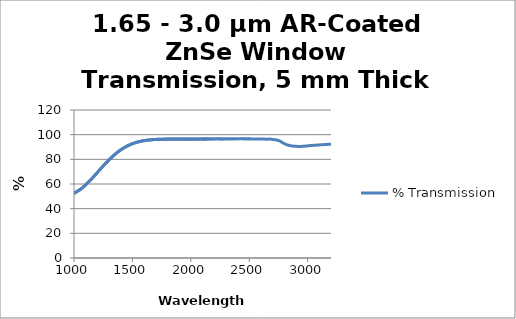
| Category | % Transmission |
|---|---|
| 200.0 | 0.103 |
| 201.0 | 0.503 |
| 202.0 | 0.29 |
| 203.0 | 0.488 |
| 204.0 | 0.591 |
| 205.0 | 0.22 |
| 206.0 | 0.072 |
| 207.0 | 0.144 |
| 208.0 | 0.358 |
| 209.0 | 0.074 |
| 210.0 | 0.151 |
| 211.0 | 0.011 |
| 212.0 | 0.102 |
| 213.0 | 0.163 |
| 214.0 | 0.028 |
| 215.0 | 0.148 |
| 216.0 | 0.027 |
| 217.0 | 0.239 |
| 218.0 | 0.027 |
| 219.0 | 0.099 |
| 220.0 | 0.036 |
| 221.0 | 0.032 |
| 222.0 | 0.033 |
| 223.0 | 0.052 |
| 224.0 | 0.136 |
| 225.0 | 0.124 |
| 226.0 | 0.081 |
| 227.0 | 0.028 |
| 228.0 | 0.052 |
| 229.0 | 0.037 |
| 230.0 | 0.053 |
| 231.0 | 0.019 |
| 232.0 | 0.05 |
| 233.0 | 0.009 |
| 234.0 | 0.067 |
| 235.0 | 0.038 |
| 236.0 | 0.023 |
| 237.0 | 0.031 |
| 238.0 | 0.028 |
| 239.0 | 0.024 |
| 240.0 | 0.084 |
| 241.0 | 0.049 |
| 242.0 | 0.003 |
| 243.0 | 0.014 |
| 244.0 | 0.02 |
| 245.0 | 0.086 |
| 246.0 | 0.016 |
| 247.0 | 0.057 |
| 248.0 | 0.019 |
| 249.0 | 0.046 |
| 250.0 | 0.082 |
| 251.0 | 0.052 |
| 252.0 | 0.012 |
| 253.0 | 0.071 |
| 254.0 | 0.045 |
| 255.0 | 0.111 |
| 256.0 | 0.038 |
| 257.0 | 0.072 |
| 258.0 | 0.012 |
| 259.0 | 0.014 |
| 260.0 | 0.057 |
| 261.0 | 0.013 |
| 262.0 | 0.077 |
| 263.0 | 0.011 |
| 264.0 | 0.031 |
| 265.0 | 0.084 |
| 266.0 | 0.119 |
| 267.0 | 0.043 |
| 268.0 | 0.095 |
| 269.0 | 0.002 |
| 270.0 | 0.103 |
| 271.0 | 0.022 |
| 272.0 | 0.22 |
| 273.0 | 0.058 |
| 274.0 | 0.028 |
| 275.0 | 0.174 |
| 276.0 | 0.098 |
| 277.0 | 0.15 |
| 278.0 | 0.437 |
| 279.0 | 0.124 |
| 280.0 | 0.276 |
| 281.0 | 0.004 |
| 282.0 | 0.214 |
| 283.0 | 0.263 |
| 284.0 | 0.18 |
| 285.0 | 0 |
| 286.0 | 0.052 |
| 287.0 | 0.193 |
| 288.0 | 0.064 |
| 289.0 | 0.121 |
| 290.0 | 0.086 |
| 291.0 | 0.144 |
| 292.0 | 0.012 |
| 293.0 | 0.008 |
| 294.0 | 0.095 |
| 295.0 | 0.041 |
| 296.0 | 0.291 |
| 297.0 | 0.24 |
| 298.0 | 0.052 |
| 299.0 | 0.456 |
| 300.0 | 0.021 |
| 301.0 | 0.126 |
| 302.0 | 0.072 |
| 303.0 | 0.145 |
| 304.0 | 0.037 |
| 305.0 | 0.015 |
| 306.0 | 0.096 |
| 307.0 | 0.05 |
| 308.0 | 0.026 |
| 309.0 | 0.213 |
| 310.0 | 0.137 |
| 311.0 | 0.446 |
| 312.0 | 0.115 |
| 313.0 | 0.314 |
| 314.0 | 0.027 |
| 315.0 | 0.148 |
| 316.0 | 0.162 |
| 317.0 | 0.061 |
| 318.0 | 0.07 |
| 319.0 | 0.169 |
| 320.0 | 0.077 |
| 321.0 | 0.104 |
| 322.0 | 0.489 |
| 323.0 | 0.139 |
| 324.0 | 0.175 |
| 325.0 | 0.138 |
| 326.0 | 0.007 |
| 327.0 | 0.124 |
| 328.0 | 0.042 |
| 329.0 | 0.026 |
| 330.0 | 0.296 |
| 331.0 | 0.403 |
| 332.0 | 0.264 |
| 333.0 | 0.137 |
| 334.0 | 0.018 |
| 335.0 | 0.091 |
| 336.0 | 0.067 |
| 337.0 | 0.267 |
| 338.0 | 0.178 |
| 339.0 | 0.253 |
| 340.0 | 0.423 |
| 341.0 | 0.186 |
| 342.0 | 0.432 |
| 343.0 | 0.093 |
| 344.0 | 0.004 |
| 345.0 | 0.31 |
| 346.0 | 0.226 |
| 347.0 | 0.463 |
| 348.0 | 0.211 |
| 349.0 | 0.019 |
| 350.0 | 0.17 |
| 351.0 | 0.297 |
| 352.0 | 0.186 |
| 353.0 | 0.063 |
| 354.0 | 0.062 |
| 355.0 | 0.021 |
| 356.0 | 0.117 |
| 357.0 | 0.156 |
| 358.0 | 0.009 |
| 359.0 | 0.15 |
| 360.0 | 0.175 |
| 361.0 | 0.088 |
| 362.0 | 0.254 |
| 363.0 | 0.021 |
| 364.0 | 0.207 |
| 365.0 | 0.105 |
| 366.0 | 0.018 |
| 367.0 | 0.156 |
| 368.0 | 0.099 |
| 369.0 | 0.034 |
| 370.0 | 0.005 |
| 371.0 | 0.337 |
| 372.0 | 0.052 |
| 373.0 | 0.26 |
| 374.0 | 0.041 |
| 375.0 | 0.064 |
| 376.0 | 0.061 |
| 377.0 | 0.031 |
| 378.0 | 0.062 |
| 379.0 | 0.035 |
| 380.0 | 0.028 |
| 381.0 | 0.026 |
| 382.0 | 0.108 |
| 383.0 | 0.015 |
| 384.0 | 0.004 |
| 385.0 | 0.005 |
| 386.0 | 0.001 |
| 387.0 | 0.073 |
| 388.0 | 0.026 |
| 389.0 | 0.018 |
| 390.0 | 0.001 |
| 391.0 | 0.03 |
| 392.0 | 0.072 |
| 393.0 | 0.003 |
| 394.0 | 0.045 |
| 395.0 | 0.051 |
| 396.0 | 0.019 |
| 397.0 | 0.118 |
| 398.0 | 0.114 |
| 399.0 | 0.044 |
| 400.0 | 0.013 |
| 401.0 | 0.054 |
| 402.0 | 0.034 |
| 403.0 | 0.093 |
| 404.0 | 0.027 |
| 405.0 | 0.007 |
| 406.0 | 0.02 |
| 407.0 | 0.024 |
| 408.0 | 0 |
| 409.0 | 0.004 |
| 410.0 | 0.017 |
| 411.0 | 0.017 |
| 412.0 | 0.05 |
| 413.0 | 0.028 |
| 414.0 | 0.02 |
| 415.0 | 0.009 |
| 416.0 | 0.035 |
| 417.0 | 0.034 |
| 418.0 | 0.044 |
| 419.0 | 0.018 |
| 420.0 | 0.053 |
| 421.0 | 0.022 |
| 422.0 | 0.02 |
| 423.0 | 0.012 |
| 424.0 | 0.013 |
| 425.0 | 0.01 |
| 426.0 | 0.023 |
| 427.0 | 0.024 |
| 428.0 | 0.004 |
| 429.0 | 0.014 |
| 430.0 | 0.006 |
| 431.0 | 0.017 |
| 432.0 | 0.039 |
| 433.0 | 0.027 |
| 434.0 | 0.009 |
| 435.0 | 0.026 |
| 436.0 | 0.009 |
| 437.0 | 0.01 |
| 438.0 | 0.019 |
| 439.0 | 0.004 |
| 440.0 | 0.01 |
| 441.0 | 0.023 |
| 442.0 | 0.016 |
| 443.0 | 0.022 |
| 444.0 | 0.023 |
| 445.0 | 0.016 |
| 446.0 | 0.008 |
| 447.0 | 0.007 |
| 448.0 | 0.023 |
| 449.0 | 0.005 |
| 450.0 | 0.008 |
| 451.0 | 0.015 |
| 452.0 | 0.004 |
| 453.0 | 0.016 |
| 454.0 | 0.017 |
| 455.0 | 0.008 |
| 456.0 | 0.013 |
| 457.0 | 0.006 |
| 458.0 | 0.004 |
| 459.0 | 0.015 |
| 460.0 | 0.053 |
| 461.0 | 0.001 |
| 462.0 | 0 |
| 463.0 | 0.036 |
| 464.0 | 0.015 |
| 465.0 | 0.003 |
| 466.0 | 0.029 |
| 467.0 | 0.015 |
| 468.0 | 0.026 |
| 469.0 | 0.019 |
| 470.0 | 0.024 |
| 471.0 | 0.014 |
| 472.0 | 0.001 |
| 473.0 | 0.022 |
| 474.0 | 0.073 |
| 475.0 | 0.193 |
| 476.0 | 0.447 |
| 477.0 | 0.811 |
| 478.0 | 1.261 |
| 479.0 | 1.815 |
| 480.0 | 2.378 |
| 481.0 | 2.961 |
| 482.0 | 3.583 |
| 483.0 | 4.148 |
| 484.0 | 4.747 |
| 485.0 | 5.335 |
| 486.0 | 5.918 |
| 487.0 | 6.555 |
| 488.0 | 7.177 |
| 489.0 | 7.82 |
| 490.0 | 8.458 |
| 491.0 | 9.147 |
| 492.0 | 9.832 |
| 493.0 | 10.509 |
| 494.0 | 11.228 |
| 495.0 | 11.953 |
| 496.0 | 12.651 |
| 497.0 | 13.384 |
| 498.0 | 14.083 |
| 499.0 | 14.851 |
| 500.0 | 15.579 |
| 501.0 | 16.294 |
| 502.0 | 17.055 |
| 503.0 | 17.802 |
| 504.0 | 18.538 |
| 505.0 | 19.301 |
| 506.0 | 20.069 |
| 507.0 | 20.842 |
| 508.0 | 21.631 |
| 509.0 | 22.467 |
| 510.0 | 23.311 |
| 511.0 | 24.141 |
| 512.0 | 25.081 |
| 513.0 | 25.997 |
| 514.0 | 26.946 |
| 515.0 | 28.006 |
| 516.0 | 29.059 |
| 517.0 | 30.196 |
| 518.0 | 31.372 |
| 519.0 | 32.508 |
| 520.0 | 33.697 |
| 521.0 | 34.852 |
| 522.0 | 35.943 |
| 523.0 | 36.989 |
| 524.0 | 37.966 |
| 525.0 | 38.928 |
| 526.0 | 39.776 |
| 527.0 | 40.633 |
| 528.0 | 41.462 |
| 529.0 | 42.181 |
| 530.0 | 42.943 |
| 531.0 | 43.667 |
| 532.0 | 44.337 |
| 533.0 | 45.096 |
| 534.0 | 45.762 |
| 535.0 | 46.366 |
| 536.0 | 47.049 |
| 537.0 | 47.711 |
| 538.0 | 48.294 |
| 539.0 | 48.97 |
| 540.0 | 49.591 |
| 541.0 | 50.227 |
| 542.0 | 50.838 |
| 543.0 | 51.461 |
| 544.0 | 52.076 |
| 545.0 | 52.667 |
| 546.0 | 53.254 |
| 547.0 | 53.837 |
| 548.0 | 54.541 |
| 549.0 | 54.999 |
| 550.0 | 55.514 |
| 551.0 | 56.13 |
| 552.0 | 56.67 |
| 553.0 | 57.135 |
| 554.0 | 57.679 |
| 555.0 | 58.174 |
| 556.0 | 58.626 |
| 557.0 | 59.091 |
| 558.0 | 59.545 |
| 559.0 | 59.96 |
| 560.0 | 60.395 |
| 561.0 | 60.837 |
| 562.0 | 61.202 |
| 563.0 | 61.551 |
| 564.0 | 61.996 |
| 565.0 | 62.258 |
| 566.0 | 62.575 |
| 567.0 | 62.937 |
| 568.0 | 63.184 |
| 569.0 | 63.426 |
| 570.0 | 63.682 |
| 571.0 | 63.959 |
| 572.0 | 64.142 |
| 573.0 | 64.344 |
| 574.0 | 64.538 |
| 575.0 | 64.741 |
| 576.0 | 64.801 |
| 577.0 | 64.948 |
| 578.0 | 65.087 |
| 579.0 | 65.127 |
| 580.0 | 65.194 |
| 581.0 | 65.286 |
| 582.0 | 65.273 |
| 583.0 | 65.294 |
| 584.0 | 65.327 |
| 585.0 | 65.286 |
| 586.0 | 65.242 |
| 587.0 | 65.238 |
| 588.0 | 65.146 |
| 589.0 | 65.049 |
| 590.0 | 64.953 |
| 591.0 | 64.831 |
| 592.0 | 64.748 |
| 593.0 | 64.627 |
| 594.0 | 64.41 |
| 595.0 | 64.241 |
| 596.0 | 64.129 |
| 597.0 | 63.901 |
| 598.0 | 63.686 |
| 599.0 | 63.519 |
| 600.0 | 63.31 |
| 601.0 | 63.033 |
| 602.0 | 62.857 |
| 603.0 | 62.62 |
| 604.0 | 62.36 |
| 605.0 | 62.152 |
| 606.0 | 61.864 |
| 607.0 | 61.604 |
| 608.0 | 61.376 |
| 609.0 | 61.126 |
| 610.0 | 60.817 |
| 611.0 | 60.565 |
| 612.0 | 60.318 |
| 613.0 | 60.014 |
| 614.0 | 59.755 |
| 615.0 | 59.445 |
| 616.0 | 59.158 |
| 617.0 | 58.849 |
| 618.0 | 58.58 |
| 619.0 | 58.256 |
| 620.0 | 57.99 |
| 621.0 | 57.756 |
| 622.0 | 57.443 |
| 623.0 | 57.15 |
| 624.0 | 56.858 |
| 625.0 | 56.56 |
| 626.0 | 56.281 |
| 627.0 | 56.028 |
| 628.0 | 55.727 |
| 629.0 | 55.495 |
| 630.0 | 55.229 |
| 631.0 | 54.92 |
| 632.0 | 54.676 |
| 633.0 | 54.42 |
| 634.0 | 54.157 |
| 635.0 | 53.889 |
| 636.0 | 53.659 |
| 637.0 | 53.373 |
| 638.0 | 53.16 |
| 639.0 | 52.908 |
| 640.0 | 52.67 |
| 641.0 | 52.43 |
| 642.0 | 52.204 |
| 643.0 | 51.982 |
| 644.0 | 51.74 |
| 645.0 | 51.572 |
| 646.0 | 51.333 |
| 647.0 | 51.119 |
| 648.0 | 50.906 |
| 649.0 | 50.731 |
| 650.0 | 50.536 |
| 651.0 | 50.364 |
| 652.0 | 50.198 |
| 653.0 | 49.98 |
| 654.0 | 49.823 |
| 655.0 | 49.65 |
| 656.0 | 49.476 |
| 657.0 | 49.316 |
| 658.0 | 49.174 |
| 659.0 | 48.986 |
| 660.0 | 48.837 |
| 661.0 | 48.687 |
| 662.0 | 48.553 |
| 663.0 | 48.404 |
| 664.0 | 48.305 |
| 665.0 | 48.125 |
| 666.0 | 48.034 |
| 667.0 | 47.907 |
| 668.0 | 47.745 |
| 669.0 | 47.678 |
| 670.0 | 47.562 |
| 671.0 | 47.432 |
| 672.0 | 47.349 |
| 673.0 | 47.24 |
| 674.0 | 47.162 |
| 675.0 | 47.071 |
| 676.0 | 46.984 |
| 677.0 | 46.882 |
| 678.0 | 46.798 |
| 679.0 | 46.74 |
| 680.0 | 46.629 |
| 681.0 | 46.589 |
| 682.0 | 46.531 |
| 683.0 | 46.443 |
| 684.0 | 46.362 |
| 685.0 | 46.336 |
| 686.0 | 46.264 |
| 687.0 | 46.206 |
| 688.0 | 46.163 |
| 689.0 | 46.108 |
| 690.0 | 46.04 |
| 691.0 | 46.015 |
| 692.0 | 45.997 |
| 693.0 | 45.966 |
| 694.0 | 45.95 |
| 695.0 | 45.891 |
| 696.0 | 45.871 |
| 697.0 | 45.836 |
| 698.0 | 45.818 |
| 699.0 | 45.803 |
| 700.0 | 45.797 |
| 701.0 | 45.774 |
| 702.0 | 45.767 |
| 703.0 | 45.749 |
| 704.0 | 45.728 |
| 705.0 | 45.728 |
| 706.0 | 45.724 |
| 707.0 | 45.722 |
| 708.0 | 45.741 |
| 709.0 | 45.761 |
| 710.0 | 45.757 |
| 711.0 | 45.747 |
| 712.0 | 45.774 |
| 713.0 | 45.783 |
| 714.0 | 45.768 |
| 715.0 | 45.808 |
| 716.0 | 45.834 |
| 717.0 | 45.854 |
| 718.0 | 45.889 |
| 719.0 | 45.906 |
| 720.0 | 45.912 |
| 721.0 | 45.932 |
| 722.0 | 45.984 |
| 723.0 | 46.001 |
| 724.0 | 46.027 |
| 725.0 | 46.046 |
| 726.0 | 46.061 |
| 727.0 | 46.124 |
| 728.0 | 46.172 |
| 729.0 | 46.203 |
| 730.0 | 46.215 |
| 731.0 | 46.279 |
| 732.0 | 46.29 |
| 733.0 | 46.35 |
| 734.0 | 46.409 |
| 735.0 | 46.405 |
| 736.0 | 46.488 |
| 737.0 | 46.53 |
| 738.0 | 46.576 |
| 739.0 | 46.637 |
| 740.0 | 46.679 |
| 741.0 | 46.678 |
| 742.0 | 46.791 |
| 743.0 | 46.798 |
| 744.0 | 46.836 |
| 745.0 | 46.895 |
| 746.0 | 46.96 |
| 747.0 | 46.986 |
| 748.0 | 47.013 |
| 749.0 | 47.136 |
| 750.0 | 47.136 |
| 751.0 | 47.212 |
| 752.0 | 47.268 |
| 753.0 | 47.294 |
| 754.0 | 47.347 |
| 755.0 | 47.405 |
| 756.0 | 47.462 |
| 757.0 | 47.501 |
| 758.0 | 47.596 |
| 759.0 | 47.62 |
| 760.0 | 47.668 |
| 761.0 | 47.729 |
| 762.0 | 47.814 |
| 763.0 | 47.842 |
| 764.0 | 47.899 |
| 765.0 | 47.962 |
| 766.0 | 48.005 |
| 767.0 | 48.087 |
| 768.0 | 48.091 |
| 769.0 | 48.144 |
| 770.0 | 48.219 |
| 771.0 | 48.25 |
| 772.0 | 48.307 |
| 773.0 | 48.364 |
| 774.0 | 48.408 |
| 775.0 | 48.415 |
| 776.0 | 48.5 |
| 777.0 | 48.578 |
| 778.0 | 48.56 |
| 779.0 | 48.661 |
| 780.0 | 48.704 |
| 781.0 | 48.722 |
| 782.0 | 48.786 |
| 783.0 | 48.842 |
| 784.0 | 48.882 |
| 785.0 | 48.91 |
| 786.0 | 48.983 |
| 787.0 | 49.018 |
| 788.0 | 49.062 |
| 789.0 | 49.098 |
| 790.0 | 49.128 |
| 791.0 | 49.182 |
| 792.0 | 49.219 |
| 793.0 | 49.256 |
| 794.0 | 49.285 |
| 795.0 | 49.342 |
| 796.0 | 49.375 |
| 797.0 | 49.41 |
| 798.0 | 49.467 |
| 799.0 | 49.481 |
| 800.0 | 49.394 |
| 801.0 | 49.429 |
| 802.0 | 49.455 |
| 803.0 | 49.486 |
| 804.0 | 49.529 |
| 805.0 | 49.561 |
| 806.0 | 49.579 |
| 807.0 | 49.611 |
| 808.0 | 49.647 |
| 809.0 | 49.645 |
| 810.0 | 49.707 |
| 811.0 | 49.715 |
| 812.0 | 49.739 |
| 813.0 | 49.772 |
| 814.0 | 49.786 |
| 815.0 | 49.818 |
| 816.0 | 49.844 |
| 817.0 | 49.874 |
| 818.0 | 49.892 |
| 819.0 | 49.917 |
| 820.0 | 49.919 |
| 821.0 | 49.943 |
| 822.0 | 49.948 |
| 823.0 | 49.986 |
| 824.0 | 49.977 |
| 825.0 | 50.012 |
| 826.0 | 50.035 |
| 827.0 | 50.042 |
| 828.0 | 50.052 |
| 829.0 | 50.074 |
| 830.0 | 50.085 |
| 831.0 | 50.102 |
| 832.0 | 50.118 |
| 833.0 | 50.134 |
| 834.0 | 50.118 |
| 835.0 | 50.156 |
| 836.0 | 50.164 |
| 837.0 | 50.157 |
| 838.0 | 50.191 |
| 839.0 | 50.194 |
| 840.0 | 50.203 |
| 841.0 | 50.209 |
| 842.0 | 50.239 |
| 843.0 | 50.221 |
| 844.0 | 50.235 |
| 845.0 | 50.263 |
| 846.0 | 50.242 |
| 847.0 | 50.246 |
| 848.0 | 50.261 |
| 849.0 | 50.25 |
| 850.0 | 50.266 |
| 851.0 | 50.261 |
| 852.0 | 50.262 |
| 853.0 | 50.249 |
| 854.0 | 50.28 |
| 855.0 | 50.272 |
| 856.0 | 50.259 |
| 857.0 | 50.275 |
| 858.0 | 50.291 |
| 859.0 | 50.28 |
| 860.0 | 50.291 |
| 861.0 | 50.277 |
| 862.0 | 50.297 |
| 863.0 | 50.298 |
| 864.0 | 50.294 |
| 865.0 | 50.276 |
| 866.0 | 50.302 |
| 867.0 | 50.279 |
| 868.0 | 50.287 |
| 869.0 | 50.297 |
| 870.0 | 50.291 |
| 871.0 | 50.287 |
| 872.0 | 50.295 |
| 873.0 | 50.28 |
| 874.0 | 50.305 |
| 875.0 | 50.292 |
| 876.0 | 50.305 |
| 877.0 | 50.289 |
| 878.0 | 50.299 |
| 879.0 | 50.317 |
| 880.0 | 50.289 |
| 881.0 | 50.288 |
| 882.0 | 50.309 |
| 883.0 | 50.284 |
| 884.0 | 50.305 |
| 885.0 | 50.295 |
| 886.0 | 50.299 |
| 887.0 | 50.28 |
| 888.0 | 50.287 |
| 889.0 | 50.284 |
| 890.0 | 50.286 |
| 891.0 | 50.273 |
| 892.0 | 50.283 |
| 893.0 | 50.267 |
| 894.0 | 50.278 |
| 895.0 | 50.272 |
| 896.0 | 50.272 |
| 897.0 | 50.283 |
| 898.0 | 50.275 |
| 899.0 | 50.303 |
| 900.0 | 50.28 |
| 901.0 | 50.275 |
| 902.0 | 50.252 |
| 903.0 | 50.255 |
| 904.0 | 50.268 |
| 905.0 | 50.254 |
| 906.0 | 50.26 |
| 907.0 | 50.245 |
| 908.0 | 50.25 |
| 909.0 | 50.262 |
| 910.0 | 50.255 |
| 911.0 | 50.253 |
| 912.0 | 50.265 |
| 913.0 | 50.247 |
| 914.0 | 50.241 |
| 915.0 | 50.261 |
| 916.0 | 50.264 |
| 917.0 | 50.253 |
| 918.0 | 50.277 |
| 919.0 | 50.277 |
| 920.0 | 50.265 |
| 921.0 | 50.283 |
| 922.0 | 50.294 |
| 923.0 | 50.293 |
| 924.0 | 50.31 |
| 925.0 | 50.314 |
| 926.0 | 50.31 |
| 927.0 | 50.341 |
| 928.0 | 50.345 |
| 929.0 | 50.37 |
| 930.0 | 50.364 |
| 931.0 | 50.38 |
| 932.0 | 50.38 |
| 933.0 | 50.393 |
| 934.0 | 50.402 |
| 935.0 | 50.445 |
| 936.0 | 50.483 |
| 937.0 | 50.491 |
| 938.0 | 50.489 |
| 939.0 | 50.511 |
| 940.0 | 50.537 |
| 941.0 | 50.534 |
| 942.0 | 50.567 |
| 943.0 | 50.575 |
| 944.0 | 50.584 |
| 945.0 | 50.607 |
| 946.0 | 50.619 |
| 947.0 | 50.649 |
| 948.0 | 50.657 |
| 949.0 | 50.699 |
| 950.0 | 50.683 |
| 951.0 | 50.725 |
| 952.0 | 50.742 |
| 953.0 | 50.746 |
| 954.0 | 50.78 |
| 955.0 | 50.811 |
| 956.0 | 50.824 |
| 957.0 | 50.85 |
| 958.0 | 50.891 |
| 959.0 | 50.913 |
| 960.0 | 50.918 |
| 961.0 | 50.96 |
| 962.0 | 50.981 |
| 963.0 | 51.014 |
| 964.0 | 51.039 |
| 965.0 | 51.063 |
| 966.0 | 51.081 |
| 967.0 | 51.097 |
| 968.0 | 51.101 |
| 969.0 | 51.088 |
| 970.0 | 51.07 |
| 971.0 | 50.993 |
| 972.0 | 50.924 |
| 973.0 | 50.885 |
| 974.0 | 50.855 |
| 975.0 | 50.867 |
| 976.0 | 50.954 |
| 977.0 | 51.068 |
| 978.0 | 51.201 |
| 979.0 | 51.325 |
| 980.0 | 51.441 |
| 981.0 | 51.534 |
| 982.0 | 51.6 |
| 983.0 | 51.682 |
| 984.0 | 51.723 |
| 985.0 | 51.792 |
| 986.0 | 51.845 |
| 987.0 | 51.885 |
| 988.0 | 51.928 |
| 989.0 | 51.979 |
| 990.0 | 52.036 |
| 991.0 | 52.064 |
| 992.0 | 52.129 |
| 993.0 | 52.157 |
| 994.0 | 52.214 |
| 995.0 | 52.233 |
| 996.0 | 52.271 |
| 997.0 | 52.328 |
| 998.0 | 52.389 |
| 999.0 | 52.428 |
| 1000.0 | 52.495 |
| 1001.0 | 52.543 |
| 1002.0 | 52.578 |
| 1003.0 | 52.623 |
| 1004.0 | 52.677 |
| 1005.0 | 52.741 |
| 1006.0 | 52.792 |
| 1007.0 | 52.851 |
| 1008.0 | 52.876 |
| 1009.0 | 52.943 |
| 1010.0 | 53.01 |
| 1011.0 | 53.064 |
| 1012.0 | 53.109 |
| 1013.0 | 53.176 |
| 1014.0 | 53.219 |
| 1015.0 | 53.286 |
| 1016.0 | 53.346 |
| 1017.0 | 53.372 |
| 1018.0 | 53.448 |
| 1019.0 | 53.509 |
| 1020.0 | 53.556 |
| 1021.0 | 53.602 |
| 1022.0 | 53.665 |
| 1023.0 | 53.732 |
| 1024.0 | 53.8 |
| 1025.0 | 53.86 |
| 1026.0 | 53.92 |
| 1027.0 | 53.958 |
| 1028.0 | 54.033 |
| 1029.0 | 54.075 |
| 1030.0 | 54.159 |
| 1031.0 | 54.233 |
| 1032.0 | 54.297 |
| 1033.0 | 54.356 |
| 1034.0 | 54.423 |
| 1035.0 | 54.485 |
| 1036.0 | 54.527 |
| 1037.0 | 54.606 |
| 1038.0 | 54.682 |
| 1039.0 | 54.722 |
| 1040.0 | 54.809 |
| 1041.0 | 54.88 |
| 1042.0 | 54.923 |
| 1043.0 | 55.011 |
| 1044.0 | 55.078 |
| 1045.0 | 55.139 |
| 1046.0 | 55.208 |
| 1047.0 | 55.291 |
| 1048.0 | 55.348 |
| 1049.0 | 55.419 |
| 1050.0 | 55.229 |
| 1051.0 | 55.367 |
| 1052.0 | 55.436 |
| 1053.0 | 55.503 |
| 1054.0 | 55.596 |
| 1055.0 | 55.636 |
| 1056.0 | 55.668 |
| 1057.0 | 55.743 |
| 1058.0 | 55.869 |
| 1059.0 | 55.952 |
| 1060.0 | 56.02 |
| 1061.0 | 56.056 |
| 1062.0 | 56.165 |
| 1063.0 | 56.259 |
| 1064.0 | 56.303 |
| 1065.0 | 56.435 |
| 1066.0 | 56.462 |
| 1067.0 | 56.568 |
| 1068.0 | 56.619 |
| 1069.0 | 56.651 |
| 1070.0 | 56.769 |
| 1071.0 | 56.881 |
| 1072.0 | 56.938 |
| 1073.0 | 57.012 |
| 1074.0 | 57.117 |
| 1075.0 | 57.203 |
| 1076.0 | 57.293 |
| 1077.0 | 57.347 |
| 1078.0 | 57.413 |
| 1079.0 | 57.52 |
| 1080.0 | 57.622 |
| 1081.0 | 57.696 |
| 1082.0 | 57.75 |
| 1083.0 | 57.862 |
| 1084.0 | 57.938 |
| 1085.0 | 58.034 |
| 1086.0 | 58.099 |
| 1087.0 | 58.176 |
| 1088.0 | 58.285 |
| 1089.0 | 58.345 |
| 1090.0 | 58.451 |
| 1091.0 | 58.534 |
| 1092.0 | 58.619 |
| 1093.0 | 58.679 |
| 1094.0 | 58.804 |
| 1095.0 | 58.898 |
| 1096.0 | 58.949 |
| 1097.0 | 59.078 |
| 1098.0 | 59.119 |
| 1099.0 | 59.223 |
| 1100.0 | 59.335 |
| 1101.0 | 59.425 |
| 1102.0 | 59.507 |
| 1103.0 | 59.569 |
| 1104.0 | 59.647 |
| 1105.0 | 59.769 |
| 1106.0 | 59.83 |
| 1107.0 | 59.935 |
| 1108.0 | 60.041 |
| 1109.0 | 60.118 |
| 1110.0 | 60.192 |
| 1111.0 | 60.297 |
| 1112.0 | 60.406 |
| 1113.0 | 60.475 |
| 1114.0 | 60.598 |
| 1115.0 | 60.69 |
| 1116.0 | 60.769 |
| 1117.0 | 60.853 |
| 1118.0 | 60.949 |
| 1119.0 | 61.039 |
| 1120.0 | 61.155 |
| 1121.0 | 61.252 |
| 1122.0 | 61.321 |
| 1123.0 | 61.438 |
| 1124.0 | 61.502 |
| 1125.0 | 61.632 |
| 1126.0 | 61.709 |
| 1127.0 | 61.8 |
| 1128.0 | 61.927 |
| 1129.0 | 61.985 |
| 1130.0 | 62.13 |
| 1131.0 | 62.203 |
| 1132.0 | 62.31 |
| 1133.0 | 62.407 |
| 1134.0 | 62.536 |
| 1135.0 | 62.609 |
| 1136.0 | 62.697 |
| 1137.0 | 62.764 |
| 1138.0 | 62.913 |
| 1139.0 | 63.002 |
| 1140.0 | 63.099 |
| 1141.0 | 63.191 |
| 1142.0 | 63.284 |
| 1143.0 | 63.387 |
| 1144.0 | 63.499 |
| 1145.0 | 63.596 |
| 1146.0 | 63.691 |
| 1147.0 | 63.826 |
| 1148.0 | 63.917 |
| 1149.0 | 63.992 |
| 1150.0 | 64.089 |
| 1151.0 | 64.185 |
| 1152.0 | 64.272 |
| 1153.0 | 64.412 |
| 1154.0 | 64.509 |
| 1155.0 | 64.598 |
| 1156.0 | 64.673 |
| 1157.0 | 64.796 |
| 1158.0 | 64.92 |
| 1159.0 | 65.014 |
| 1160.0 | 65.131 |
| 1161.0 | 65.216 |
| 1162.0 | 65.288 |
| 1163.0 | 65.411 |
| 1164.0 | 65.518 |
| 1165.0 | 65.634 |
| 1166.0 | 65.732 |
| 1167.0 | 65.806 |
| 1168.0 | 65.926 |
| 1169.0 | 66.043 |
| 1170.0 | 66.137 |
| 1171.0 | 66.247 |
| 1172.0 | 66.368 |
| 1173.0 | 66.458 |
| 1174.0 | 66.565 |
| 1175.0 | 66.702 |
| 1176.0 | 66.783 |
| 1177.0 | 66.867 |
| 1178.0 | 66.997 |
| 1179.0 | 67.072 |
| 1180.0 | 67.178 |
| 1181.0 | 67.3 |
| 1182.0 | 67.403 |
| 1183.0 | 67.492 |
| 1184.0 | 67.633 |
| 1185.0 | 67.707 |
| 1186.0 | 67.844 |
| 1187.0 | 67.952 |
| 1188.0 | 68.035 |
| 1189.0 | 68.122 |
| 1190.0 | 68.278 |
| 1191.0 | 68.362 |
| 1192.0 | 68.44 |
| 1193.0 | 68.599 |
| 1194.0 | 68.666 |
| 1195.0 | 68.776 |
| 1196.0 | 68.896 |
| 1197.0 | 69.019 |
| 1198.0 | 69.074 |
| 1199.0 | 69.235 |
| 1200.0 | 69.382 |
| 1201.0 | 69.526 |
| 1202.0 | 69.612 |
| 1203.0 | 69.75 |
| 1204.0 | 69.893 |
| 1205.0 | 69.941 |
| 1206.0 | 70.071 |
| 1207.0 | 70.199 |
| 1208.0 | 70.219 |
| 1209.0 | 70.358 |
| 1210.0 | 70.497 |
| 1211.0 | 70.54 |
| 1212.0 | 70.683 |
| 1213.0 | 70.767 |
| 1214.0 | 70.865 |
| 1215.0 | 70.948 |
| 1216.0 | 71.097 |
| 1217.0 | 71.176 |
| 1218.0 | 71.283 |
| 1219.0 | 71.427 |
| 1220.0 | 71.499 |
| 1221.0 | 71.622 |
| 1222.0 | 71.749 |
| 1223.0 | 71.84 |
| 1224.0 | 71.904 |
| 1225.0 | 72.033 |
| 1226.0 | 72.146 |
| 1227.0 | 72.203 |
| 1228.0 | 72.355 |
| 1229.0 | 72.451 |
| 1230.0 | 72.556 |
| 1231.0 | 72.65 |
| 1232.0 | 72.781 |
| 1233.0 | 72.863 |
| 1234.0 | 72.96 |
| 1235.0 | 73.126 |
| 1236.0 | 73.176 |
| 1237.0 | 73.286 |
| 1238.0 | 73.387 |
| 1239.0 | 73.468 |
| 1240.0 | 73.581 |
| 1241.0 | 73.681 |
| 1242.0 | 73.817 |
| 1243.0 | 73.933 |
| 1244.0 | 73.998 |
| 1245.0 | 74.1 |
| 1246.0 | 74.23 |
| 1247.0 | 74.34 |
| 1248.0 | 74.406 |
| 1249.0 | 74.534 |
| 1250.0 | 74.637 |
| 1251.0 | 74.709 |
| 1252.0 | 74.844 |
| 1253.0 | 74.938 |
| 1254.0 | 75.042 |
| 1255.0 | 75.15 |
| 1256.0 | 75.245 |
| 1257.0 | 75.348 |
| 1258.0 | 75.444 |
| 1259.0 | 75.548 |
| 1260.0 | 75.671 |
| 1261.0 | 75.778 |
| 1262.0 | 75.875 |
| 1263.0 | 75.93 |
| 1264.0 | 76.065 |
| 1265.0 | 76.152 |
| 1266.0 | 76.274 |
| 1267.0 | 76.346 |
| 1268.0 | 76.461 |
| 1269.0 | 76.547 |
| 1270.0 | 76.667 |
| 1271.0 | 76.768 |
| 1272.0 | 76.865 |
| 1273.0 | 76.948 |
| 1274.0 | 77.098 |
| 1275.0 | 77.188 |
| 1276.0 | 77.26 |
| 1277.0 | 77.418 |
| 1278.0 | 77.474 |
| 1279.0 | 77.579 |
| 1280.0 | 77.719 |
| 1281.0 | 77.759 |
| 1282.0 | 77.871 |
| 1283.0 | 77.957 |
| 1284.0 | 78.081 |
| 1285.0 | 78.148 |
| 1286.0 | 78.218 |
| 1287.0 | 78.373 |
| 1288.0 | 78.428 |
| 1289.0 | 78.549 |
| 1290.0 | 78.668 |
| 1291.0 | 78.703 |
| 1292.0 | 78.815 |
| 1293.0 | 78.931 |
| 1294.0 | 79.031 |
| 1295.0 | 79.099 |
| 1296.0 | 79.23 |
| 1297.0 | 79.316 |
| 1298.0 | 79.445 |
| 1299.0 | 79.52 |
| 1300.0 | 79.55 |
| 1301.0 | 79.683 |
| 1302.0 | 79.816 |
| 1303.0 | 79.871 |
| 1304.0 | 79.962 |
| 1305.0 | 80.086 |
| 1306.0 | 80.147 |
| 1307.0 | 80.236 |
| 1308.0 | 80.367 |
| 1309.0 | 80.457 |
| 1310.0 | 80.515 |
| 1311.0 | 80.613 |
| 1312.0 | 80.731 |
| 1313.0 | 80.783 |
| 1314.0 | 80.904 |
| 1315.0 | 81.011 |
| 1316.0 | 81.031 |
| 1317.0 | 81.191 |
| 1318.0 | 81.269 |
| 1319.0 | 81.324 |
| 1320.0 | 81.448 |
| 1321.0 | 81.545 |
| 1322.0 | 81.606 |
| 1323.0 | 81.69 |
| 1324.0 | 81.815 |
| 1325.0 | 81.835 |
| 1326.0 | 81.991 |
| 1327.0 | 82.028 |
| 1328.0 | 82.128 |
| 1329.0 | 82.241 |
| 1330.0 | 82.304 |
| 1331.0 | 82.389 |
| 1332.0 | 82.512 |
| 1333.0 | 82.587 |
| 1334.0 | 82.668 |
| 1335.0 | 82.731 |
| 1336.0 | 82.849 |
| 1337.0 | 82.902 |
| 1338.0 | 82.999 |
| 1339.0 | 83.075 |
| 1340.0 | 83.146 |
| 1341.0 | 83.258 |
| 1342.0 | 83.342 |
| 1343.0 | 83.382 |
| 1344.0 | 83.472 |
| 1345.0 | 83.615 |
| 1346.0 | 83.665 |
| 1347.0 | 83.745 |
| 1348.0 | 83.828 |
| 1349.0 | 83.921 |
| 1350.0 | 83.995 |
| 1351.0 | 84.074 |
| 1352.0 | 84.139 |
| 1353.0 | 84.209 |
| 1354.0 | 84.285 |
| 1355.0 | 84.405 |
| 1356.0 | 84.48 |
| 1357.0 | 84.593 |
| 1358.0 | 84.624 |
| 1359.0 | 84.733 |
| 1360.0 | 84.781 |
| 1361.0 | 84.894 |
| 1362.0 | 84.96 |
| 1363.0 | 85.059 |
| 1364.0 | 85.065 |
| 1365.0 | 85.181 |
| 1366.0 | 85.296 |
| 1367.0 | 85.314 |
| 1368.0 | 85.408 |
| 1369.0 | 85.511 |
| 1370.0 | 85.536 |
| 1371.0 | 85.613 |
| 1372.0 | 85.706 |
| 1373.0 | 85.781 |
| 1374.0 | 85.843 |
| 1375.0 | 85.935 |
| 1376.0 | 85.986 |
| 1377.0 | 86.047 |
| 1378.0 | 86.113 |
| 1379.0 | 86.196 |
| 1380.0 | 86.256 |
| 1381.0 | 86.345 |
| 1382.0 | 86.469 |
| 1383.0 | 86.5 |
| 1384.0 | 86.608 |
| 1385.0 | 86.67 |
| 1386.0 | 86.698 |
| 1387.0 | 86.802 |
| 1388.0 | 86.89 |
| 1389.0 | 86.899 |
| 1390.0 | 86.981 |
| 1391.0 | 87.061 |
| 1392.0 | 87.082 |
| 1393.0 | 87.164 |
| 1394.0 | 87.27 |
| 1395.0 | 87.331 |
| 1396.0 | 87.393 |
| 1397.0 | 87.487 |
| 1398.0 | 87.524 |
| 1399.0 | 87.569 |
| 1400.0 | 87.657 |
| 1401.0 | 87.702 |
| 1402.0 | 87.797 |
| 1403.0 | 87.849 |
| 1404.0 | 87.914 |
| 1405.0 | 87.968 |
| 1406.0 | 88.05 |
| 1407.0 | 88.107 |
| 1408.0 | 88.174 |
| 1409.0 | 88.279 |
| 1410.0 | 88.293 |
| 1411.0 | 88.38 |
| 1412.0 | 88.432 |
| 1413.0 | 88.463 |
| 1414.0 | 88.526 |
| 1415.0 | 88.621 |
| 1416.0 | 88.66 |
| 1417.0 | 88.746 |
| 1418.0 | 88.797 |
| 1419.0 | 88.814 |
| 1420.0 | 88.879 |
| 1421.0 | 88.943 |
| 1422.0 | 89.011 |
| 1423.0 | 89.065 |
| 1424.0 | 89.155 |
| 1425.0 | 89.21 |
| 1426.0 | 89.219 |
| 1427.0 | 89.312 |
| 1428.0 | 89.367 |
| 1429.0 | 89.393 |
| 1430.0 | 89.461 |
| 1431.0 | 89.536 |
| 1432.0 | 89.561 |
| 1433.0 | 89.644 |
| 1434.0 | 89.686 |
| 1435.0 | 89.731 |
| 1436.0 | 89.803 |
| 1437.0 | 89.872 |
| 1438.0 | 89.91 |
| 1439.0 | 89.94 |
| 1440.0 | 90.029 |
| 1441.0 | 90.045 |
| 1442.0 | 90.119 |
| 1443.0 | 90.181 |
| 1444.0 | 90.22 |
| 1445.0 | 90.266 |
| 1446.0 | 90.34 |
| 1447.0 | 90.385 |
| 1448.0 | 90.453 |
| 1449.0 | 90.493 |
| 1450.0 | 90.529 |
| 1451.0 | 90.576 |
| 1452.0 | 90.633 |
| 1453.0 | 90.683 |
| 1454.0 | 90.76 |
| 1455.0 | 90.801 |
| 1456.0 | 90.809 |
| 1457.0 | 90.844 |
| 1458.0 | 90.951 |
| 1459.0 | 90.957 |
| 1460.0 | 90.999 |
| 1461.0 | 91.032 |
| 1462.0 | 91.091 |
| 1463.0 | 91.149 |
| 1464.0 | 91.231 |
| 1465.0 | 91.279 |
| 1466.0 | 91.288 |
| 1467.0 | 91.332 |
| 1468.0 | 91.352 |
| 1469.0 | 91.419 |
| 1470.0 | 91.474 |
| 1471.0 | 91.508 |
| 1472.0 | 91.549 |
| 1473.0 | 91.614 |
| 1474.0 | 91.652 |
| 1475.0 | 91.673 |
| 1476.0 | 91.729 |
| 1477.0 | 91.815 |
| 1478.0 | 91.796 |
| 1479.0 | 91.858 |
| 1480.0 | 91.902 |
| 1481.0 | 91.964 |
| 1482.0 | 91.979 |
| 1483.0 | 92.013 |
| 1484.0 | 92.071 |
| 1485.0 | 92.078 |
| 1486.0 | 92.164 |
| 1487.0 | 92.182 |
| 1488.0 | 92.201 |
| 1489.0 | 92.287 |
| 1490.0 | 92.28 |
| 1491.0 | 92.344 |
| 1492.0 | 92.384 |
| 1493.0 | 92.399 |
| 1494.0 | 92.426 |
| 1495.0 | 92.504 |
| 1496.0 | 92.525 |
| 1497.0 | 92.559 |
| 1498.0 | 92.597 |
| 1499.0 | 92.616 |
| 1500.0 | 92.639 |
| 1501.0 | 92.677 |
| 1502.0 | 92.724 |
| 1503.0 | 92.757 |
| 1504.0 | 92.797 |
| 1505.0 | 92.832 |
| 1506.0 | 92.857 |
| 1507.0 | 92.919 |
| 1508.0 | 92.943 |
| 1509.0 | 92.942 |
| 1510.0 | 93.03 |
| 1511.0 | 93.037 |
| 1512.0 | 93.055 |
| 1513.0 | 93.104 |
| 1514.0 | 93.153 |
| 1515.0 | 93.148 |
| 1516.0 | 93.211 |
| 1517.0 | 93.227 |
| 1518.0 | 93.239 |
| 1519.0 | 93.303 |
| 1520.0 | 93.328 |
| 1521.0 | 93.357 |
| 1522.0 | 93.376 |
| 1523.0 | 93.409 |
| 1524.0 | 93.438 |
| 1525.0 | 93.441 |
| 1526.0 | 93.507 |
| 1527.0 | 93.53 |
| 1528.0 | 93.561 |
| 1529.0 | 93.576 |
| 1530.0 | 93.588 |
| 1531.0 | 93.671 |
| 1532.0 | 93.709 |
| 1533.0 | 93.702 |
| 1534.0 | 93.716 |
| 1535.0 | 93.767 |
| 1536.0 | 93.759 |
| 1537.0 | 93.838 |
| 1538.0 | 93.839 |
| 1539.0 | 93.844 |
| 1540.0 | 93.881 |
| 1541.0 | 93.921 |
| 1542.0 | 93.962 |
| 1543.0 | 93.959 |
| 1544.0 | 94.052 |
| 1545.0 | 94.033 |
| 1546.0 | 94.03 |
| 1547.0 | 94.065 |
| 1548.0 | 94.116 |
| 1549.0 | 94.139 |
| 1550.0 | 94.216 |
| 1551.0 | 94.179 |
| 1552.0 | 94.206 |
| 1553.0 | 94.267 |
| 1554.0 | 94.237 |
| 1555.0 | 94.289 |
| 1556.0 | 94.276 |
| 1557.0 | 94.314 |
| 1558.0 | 94.35 |
| 1559.0 | 94.364 |
| 1560.0 | 94.405 |
| 1561.0 | 94.425 |
| 1562.0 | 94.418 |
| 1563.0 | 94.499 |
| 1564.0 | 94.473 |
| 1565.0 | 94.488 |
| 1566.0 | 94.527 |
| 1567.0 | 94.541 |
| 1568.0 | 94.582 |
| 1569.0 | 94.6 |
| 1570.0 | 94.591 |
| 1571.0 | 94.582 |
| 1572.0 | 94.677 |
| 1573.0 | 94.669 |
| 1574.0 | 94.742 |
| 1575.0 | 94.742 |
| 1576.0 | 94.735 |
| 1577.0 | 94.756 |
| 1578.0 | 94.752 |
| 1579.0 | 94.783 |
| 1580.0 | 94.824 |
| 1581.0 | 94.835 |
| 1582.0 | 94.879 |
| 1583.0 | 94.875 |
| 1584.0 | 94.872 |
| 1585.0 | 94.892 |
| 1586.0 | 94.888 |
| 1587.0 | 94.965 |
| 1588.0 | 94.947 |
| 1589.0 | 94.971 |
| 1590.0 | 94.99 |
| 1591.0 | 95.014 |
| 1592.0 | 94.981 |
| 1593.0 | 95.042 |
| 1594.0 | 95.028 |
| 1595.0 | 95.073 |
| 1596.0 | 95.065 |
| 1597.0 | 95.068 |
| 1598.0 | 95.086 |
| 1599.0 | 95.145 |
| 1600.0 | 95.147 |
| 1601.0 | 95.156 |
| 1602.0 | 95.141 |
| 1603.0 | 95.17 |
| 1604.0 | 95.223 |
| 1605.0 | 95.274 |
| 1606.0 | 95.259 |
| 1607.0 | 95.226 |
| 1608.0 | 95.269 |
| 1609.0 | 95.283 |
| 1610.0 | 95.282 |
| 1611.0 | 95.285 |
| 1612.0 | 95.355 |
| 1613.0 | 95.334 |
| 1614.0 | 95.324 |
| 1615.0 | 95.347 |
| 1616.0 | 95.315 |
| 1617.0 | 95.385 |
| 1618.0 | 95.429 |
| 1619.0 | 95.477 |
| 1620.0 | 95.45 |
| 1621.0 | 95.44 |
| 1622.0 | 95.447 |
| 1623.0 | 95.499 |
| 1624.0 | 95.498 |
| 1625.0 | 95.493 |
| 1626.0 | 95.512 |
| 1627.0 | 95.529 |
| 1628.0 | 95.497 |
| 1629.0 | 95.505 |
| 1630.0 | 95.539 |
| 1631.0 | 95.509 |
| 1632.0 | 95.583 |
| 1633.0 | 95.578 |
| 1634.0 | 95.562 |
| 1635.0 | 95.567 |
| 1636.0 | 95.634 |
| 1637.0 | 95.63 |
| 1638.0 | 95.65 |
| 1639.0 | 95.639 |
| 1640.0 | 95.666 |
| 1641.0 | 95.657 |
| 1642.0 | 95.686 |
| 1643.0 | 95.686 |
| 1644.0 | 95.695 |
| 1645.0 | 95.716 |
| 1646.0 | 95.728 |
| 1647.0 | 95.713 |
| 1648.0 | 95.728 |
| 1649.0 | 95.733 |
| 1650.0 | 95.707 |
| 1651.0 | 95.741 |
| 1652.0 | 95.804 |
| 1653.0 | 95.79 |
| 1654.0 | 95.782 |
| 1655.0 | 95.792 |
| 1656.0 | 95.768 |
| 1657.0 | 95.805 |
| 1658.0 | 95.842 |
| 1659.0 | 95.816 |
| 1660.0 | 95.838 |
| 1661.0 | 95.895 |
| 1662.0 | 95.856 |
| 1663.0 | 95.893 |
| 1664.0 | 95.885 |
| 1665.0 | 95.931 |
| 1666.0 | 95.919 |
| 1667.0 | 95.935 |
| 1668.0 | 95.912 |
| 1669.0 | 95.896 |
| 1670.0 | 95.94 |
| 1671.0 | 95.866 |
| 1672.0 | 95.968 |
| 1673.0 | 95.961 |
| 1674.0 | 95.98 |
| 1675.0 | 95.977 |
| 1676.0 | 95.939 |
| 1677.0 | 95.976 |
| 1678.0 | 95.99 |
| 1679.0 | 95.995 |
| 1680.0 | 96.018 |
| 1681.0 | 96.013 |
| 1682.0 | 96.063 |
| 1683.0 | 96.002 |
| 1684.0 | 95.988 |
| 1685.0 | 96.046 |
| 1686.0 | 96.039 |
| 1687.0 | 96.072 |
| 1688.0 | 96.067 |
| 1689.0 | 96.027 |
| 1690.0 | 96.016 |
| 1691.0 | 96.017 |
| 1692.0 | 96.037 |
| 1693.0 | 96.078 |
| 1694.0 | 96.104 |
| 1695.0 | 96.154 |
| 1696.0 | 96.124 |
| 1697.0 | 96.11 |
| 1698.0 | 96.079 |
| 1699.0 | 96.099 |
| 1700.0 | 96.137 |
| 1701.0 | 96.122 |
| 1702.0 | 96.154 |
| 1703.0 | 96.146 |
| 1704.0 | 96.168 |
| 1705.0 | 96.132 |
| 1706.0 | 96.133 |
| 1707.0 | 96.146 |
| 1708.0 | 96.182 |
| 1709.0 | 96.213 |
| 1710.0 | 96.16 |
| 1711.0 | 96.158 |
| 1712.0 | 96.162 |
| 1713.0 | 96.168 |
| 1714.0 | 96.202 |
| 1715.0 | 96.213 |
| 1716.0 | 96.215 |
| 1717.0 | 96.18 |
| 1718.0 | 96.171 |
| 1719.0 | 96.202 |
| 1720.0 | 96.182 |
| 1721.0 | 96.155 |
| 1722.0 | 96.258 |
| 1723.0 | 96.197 |
| 1724.0 | 96.277 |
| 1725.0 | 96.258 |
| 1726.0 | 96.157 |
| 1727.0 | 96.183 |
| 1728.0 | 96.215 |
| 1729.0 | 96.161 |
| 1730.0 | 96.241 |
| 1731.0 | 96.28 |
| 1732.0 | 96.28 |
| 1733.0 | 96.186 |
| 1734.0 | 96.242 |
| 1735.0 | 96.172 |
| 1736.0 | 96.198 |
| 1737.0 | 96.279 |
| 1738.0 | 96.286 |
| 1739.0 | 96.27 |
| 1740.0 | 96.291 |
| 1741.0 | 96.241 |
| 1742.0 | 96.234 |
| 1743.0 | 96.292 |
| 1744.0 | 96.233 |
| 1745.0 | 96.327 |
| 1746.0 | 96.371 |
| 1747.0 | 96.349 |
| 1748.0 | 96.303 |
| 1749.0 | 96.367 |
| 1750.0 | 96.284 |
| 1751.0 | 96.232 |
| 1752.0 | 96.337 |
| 1753.0 | 96.338 |
| 1754.0 | 96.326 |
| 1755.0 | 96.281 |
| 1756.0 | 96.346 |
| 1757.0 | 96.309 |
| 1758.0 | 96.305 |
| 1759.0 | 96.33 |
| 1760.0 | 96.325 |
| 1761.0 | 96.294 |
| 1762.0 | 96.363 |
| 1763.0 | 96.367 |
| 1764.0 | 96.338 |
| 1765.0 | 96.301 |
| 1766.0 | 96.296 |
| 1767.0 | 96.325 |
| 1768.0 | 96.347 |
| 1769.0 | 96.366 |
| 1770.0 | 96.398 |
| 1771.0 | 96.376 |
| 1772.0 | 96.359 |
| 1773.0 | 96.283 |
| 1774.0 | 96.337 |
| 1775.0 | 96.302 |
| 1776.0 | 96.308 |
| 1777.0 | 96.353 |
| 1778.0 | 96.415 |
| 1779.0 | 96.342 |
| 1780.0 | 96.313 |
| 1781.0 | 96.373 |
| 1782.0 | 96.309 |
| 1783.0 | 96.332 |
| 1784.0 | 96.336 |
| 1785.0 | 96.422 |
| 1786.0 | 96.397 |
| 1787.0 | 96.389 |
| 1788.0 | 96.322 |
| 1789.0 | 96.335 |
| 1790.0 | 96.35 |
| 1791.0 | 96.386 |
| 1792.0 | 96.364 |
| 1793.0 | 96.43 |
| 1794.0 | 96.432 |
| 1795.0 | 96.412 |
| 1796.0 | 96.429 |
| 1797.0 | 96.374 |
| 1798.0 | 96.337 |
| 1799.0 | 96.366 |
| 1800.0 | 96.341 |
| 1801.0 | 96.404 |
| 1802.0 | 96.415 |
| 1803.0 | 96.361 |
| 1804.0 | 96.315 |
| 1805.0 | 96.329 |
| 1806.0 | 96.36 |
| 1807.0 | 96.347 |
| 1808.0 | 96.403 |
| 1809.0 | 96.352 |
| 1810.0 | 96.384 |
| 1811.0 | 96.444 |
| 1812.0 | 96.337 |
| 1813.0 | 96.325 |
| 1814.0 | 96.421 |
| 1815.0 | 96.373 |
| 1816.0 | 96.397 |
| 1817.0 | 96.46 |
| 1818.0 | 96.488 |
| 1819.0 | 96.378 |
| 1820.0 | 96.385 |
| 1821.0 | 96.392 |
| 1822.0 | 96.391 |
| 1823.0 | 96.371 |
| 1824.0 | 96.397 |
| 1825.0 | 96.465 |
| 1826.0 | 96.461 |
| 1827.0 | 96.436 |
| 1828.0 | 96.417 |
| 1829.0 | 96.412 |
| 1830.0 | 96.345 |
| 1831.0 | 96.361 |
| 1832.0 | 96.352 |
| 1833.0 | 96.453 |
| 1834.0 | 96.484 |
| 1835.0 | 96.463 |
| 1836.0 | 96.454 |
| 1837.0 | 96.318 |
| 1838.0 | 96.415 |
| 1839.0 | 96.359 |
| 1840.0 | 96.423 |
| 1841.0 | 96.4 |
| 1842.0 | 96.491 |
| 1843.0 | 96.523 |
| 1844.0 | 96.408 |
| 1845.0 | 96.422 |
| 1846.0 | 96.406 |
| 1847.0 | 96.382 |
| 1848.0 | 96.369 |
| 1849.0 | 96.422 |
| 1850.0 | 96.453 |
| 1851.0 | 96.48 |
| 1852.0 | 96.504 |
| 1853.0 | 96.473 |
| 1854.0 | 96.413 |
| 1855.0 | 96.426 |
| 1856.0 | 96.327 |
| 1857.0 | 96.33 |
| 1858.0 | 96.435 |
| 1859.0 | 96.41 |
| 1860.0 | 96.491 |
| 1861.0 | 96.401 |
| 1862.0 | 96.462 |
| 1863.0 | 96.554 |
| 1864.0 | 96.392 |
| 1865.0 | 96.409 |
| 1866.0 | 96.43 |
| 1867.0 | 96.333 |
| 1868.0 | 96.471 |
| 1869.0 | 96.49 |
| 1870.0 | 96.484 |
| 1871.0 | 96.508 |
| 1872.0 | 96.467 |
| 1873.0 | 96.48 |
| 1874.0 | 96.532 |
| 1875.0 | 96.491 |
| 1876.0 | 96.417 |
| 1877.0 | 96.441 |
| 1878.0 | 96.549 |
| 1879.0 | 96.521 |
| 1880.0 | 96.444 |
| 1881.0 | 96.339 |
| 1882.0 | 96.371 |
| 1883.0 | 96.369 |
| 1884.0 | 96.421 |
| 1885.0 | 96.389 |
| 1886.0 | 96.43 |
| 1887.0 | 96.391 |
| 1888.0 | 96.36 |
| 1889.0 | 96.367 |
| 1890.0 | 96.282 |
| 1891.0 | 96.412 |
| 1892.0 | 96.349 |
| 1893.0 | 96.396 |
| 1894.0 | 96.48 |
| 1895.0 | 96.445 |
| 1896.0 | 96.399 |
| 1897.0 | 96.414 |
| 1898.0 | 96.392 |
| 1899.0 | 96.369 |
| 1900.0 | 96.324 |
| 1901.0 | 96.491 |
| 1902.0 | 96.4 |
| 1903.0 | 96.399 |
| 1904.0 | 96.38 |
| 1905.0 | 96.429 |
| 1906.0 | 96.478 |
| 1907.0 | 96.482 |
| 1908.0 | 96.327 |
| 1909.0 | 96.309 |
| 1910.0 | 96.278 |
| 1911.0 | 96.398 |
| 1912.0 | 96.415 |
| 1913.0 | 96.481 |
| 1914.0 | 96.483 |
| 1915.0 | 96.503 |
| 1916.0 | 96.346 |
| 1917.0 | 96.336 |
| 1918.0 | 96.303 |
| 1919.0 | 96.363 |
| 1920.0 | 96.398 |
| 1921.0 | 96.401 |
| 1922.0 | 96.478 |
| 1923.0 | 96.412 |
| 1924.0 | 96.461 |
| 1925.0 | 96.365 |
| 1926.0 | 96.373 |
| 1927.0 | 96.346 |
| 1928.0 | 96.329 |
| 1929.0 | 96.337 |
| 1930.0 | 96.363 |
| 1931.0 | 96.493 |
| 1932.0 | 96.409 |
| 1933.0 | 96.423 |
| 1934.0 | 96.389 |
| 1935.0 | 96.327 |
| 1936.0 | 96.379 |
| 1937.0 | 96.286 |
| 1938.0 | 96.323 |
| 1939.0 | 96.518 |
| 1940.0 | 96.41 |
| 1941.0 | 96.37 |
| 1942.0 | 96.46 |
| 1943.0 | 96.376 |
| 1944.0 | 96.374 |
| 1945.0 | 96.349 |
| 1946.0 | 96.357 |
| 1947.0 | 96.337 |
| 1948.0 | 96.335 |
| 1949.0 | 96.393 |
| 1950.0 | 96.391 |
| 1951.0 | 96.387 |
| 1952.0 | 96.416 |
| 1953.0 | 96.49 |
| 1954.0 | 96.386 |
| 1955.0 | 96.386 |
| 1956.0 | 96.274 |
| 1957.0 | 96.374 |
| 1958.0 | 96.364 |
| 1959.0 | 96.348 |
| 1960.0 | 96.435 |
| 1961.0 | 96.453 |
| 1962.0 | 96.404 |
| 1963.0 | 96.415 |
| 1964.0 | 96.31 |
| 1965.0 | 96.359 |
| 1966.0 | 96.424 |
| 1967.0 | 96.416 |
| 1968.0 | 96.452 |
| 1969.0 | 96.387 |
| 1970.0 | 96.535 |
| 1971.0 | 96.386 |
| 1972.0 | 96.369 |
| 1973.0 | 96.429 |
| 1974.0 | 96.324 |
| 1975.0 | 96.39 |
| 1976.0 | 96.353 |
| 1977.0 | 96.411 |
| 1978.0 | 96.392 |
| 1979.0 | 96.48 |
| 1980.0 | 96.392 |
| 1981.0 | 96.448 |
| 1982.0 | 96.418 |
| 1983.0 | 96.442 |
| 1984.0 | 96.38 |
| 1985.0 | 96.325 |
| 1986.0 | 96.298 |
| 1987.0 | 96.297 |
| 1988.0 | 96.378 |
| 1989.0 | 96.444 |
| 1990.0 | 96.404 |
| 1991.0 | 96.387 |
| 1992.0 | 96.434 |
| 1993.0 | 96.323 |
| 1994.0 | 96.272 |
| 1995.0 | 96.369 |
| 1996.0 | 96.385 |
| 1997.0 | 96.376 |
| 1998.0 | 96.41 |
| 1999.0 | 96.428 |
| 2000.0 | 96.48 |
| 2001.0 | 96.343 |
| 2002.0 | 96.504 |
| 2003.0 | 96.354 |
| 2004.0 | 96.466 |
| 2005.0 | 96.423 |
| 2006.0 | 96.385 |
| 2007.0 | 96.336 |
| 2008.0 | 96.514 |
| 2009.0 | 96.444 |
| 2010.0 | 96.459 |
| 2011.0 | 96.359 |
| 2012.0 | 96.421 |
| 2013.0 | 96.453 |
| 2014.0 | 96.411 |
| 2015.0 | 96.404 |
| 2016.0 | 96.398 |
| 2017.0 | 96.413 |
| 2018.0 | 96.455 |
| 2019.0 | 96.469 |
| 2020.0 | 96.477 |
| 2021.0 | 96.491 |
| 2022.0 | 96.447 |
| 2023.0 | 96.475 |
| 2024.0 | 96.345 |
| 2025.0 | 96.434 |
| 2026.0 | 96.376 |
| 2027.0 | 96.429 |
| 2028.0 | 96.459 |
| 2029.0 | 96.485 |
| 2030.0 | 96.513 |
| 2031.0 | 96.549 |
| 2032.0 | 96.458 |
| 2033.0 | 96.458 |
| 2034.0 | 96.294 |
| 2035.0 | 96.37 |
| 2036.0 | 96.355 |
| 2037.0 | 96.368 |
| 2038.0 | 96.531 |
| 2039.0 | 96.487 |
| 2040.0 | 96.525 |
| 2041.0 | 96.466 |
| 2042.0 | 96.545 |
| 2043.0 | 96.398 |
| 2044.0 | 96.35 |
| 2045.0 | 96.399 |
| 2046.0 | 96.428 |
| 2047.0 | 96.382 |
| 2048.0 | 96.383 |
| 2049.0 | 96.391 |
| 2050.0 | 96.479 |
| 2051.0 | 96.508 |
| 2052.0 | 96.516 |
| 2053.0 | 96.407 |
| 2054.0 | 96.497 |
| 2055.0 | 96.509 |
| 2056.0 | 96.496 |
| 2057.0 | 96.435 |
| 2058.0 | 96.512 |
| 2059.0 | 96.483 |
| 2060.0 | 96.407 |
| 2061.0 | 96.488 |
| 2062.0 | 96.461 |
| 2063.0 | 96.567 |
| 2064.0 | 96.416 |
| 2065.0 | 96.462 |
| 2066.0 | 96.385 |
| 2067.0 | 96.362 |
| 2068.0 | 96.318 |
| 2069.0 | 96.459 |
| 2070.0 | 96.482 |
| 2071.0 | 96.492 |
| 2072.0 | 96.497 |
| 2073.0 | 96.497 |
| 2074.0 | 96.511 |
| 2075.0 | 96.31 |
| 2076.0 | 96.329 |
| 2077.0 | 96.38 |
| 2078.0 | 96.407 |
| 2079.0 | 96.525 |
| 2080.0 | 96.454 |
| 2081.0 | 96.425 |
| 2082.0 | 96.482 |
| 2083.0 | 96.532 |
| 2084.0 | 96.483 |
| 2085.0 | 96.557 |
| 2086.0 | 96.382 |
| 2087.0 | 96.403 |
| 2088.0 | 96.401 |
| 2089.0 | 96.531 |
| 2090.0 | 96.465 |
| 2091.0 | 96.634 |
| 2092.0 | 96.475 |
| 2093.0 | 96.556 |
| 2094.0 | 96.51 |
| 2095.0 | 96.469 |
| 2096.0 | 96.502 |
| 2097.0 | 96.511 |
| 2098.0 | 96.496 |
| 2099.0 | 96.396 |
| 2100.0 | 96.423 |
| 2101.0 | 96.283 |
| 2102.0 | 96.322 |
| 2103.0 | 96.482 |
| 2104.0 | 96.547 |
| 2105.0 | 96.562 |
| 2106.0 | 96.656 |
| 2107.0 | 96.508 |
| 2108.0 | 96.624 |
| 2109.0 | 96.479 |
| 2110.0 | 96.436 |
| 2111.0 | 96.305 |
| 2112.0 | 96.408 |
| 2113.0 | 96.414 |
| 2114.0 | 96.436 |
| 2115.0 | 96.504 |
| 2116.0 | 96.416 |
| 2117.0 | 96.41 |
| 2118.0 | 96.48 |
| 2119.0 | 96.477 |
| 2120.0 | 96.325 |
| 2121.0 | 96.519 |
| 2122.0 | 96.531 |
| 2123.0 | 96.358 |
| 2124.0 | 96.417 |
| 2125.0 | 96.54 |
| 2126.0 | 96.563 |
| 2127.0 | 96.445 |
| 2128.0 | 96.626 |
| 2129.0 | 96.616 |
| 2130.0 | 96.511 |
| 2131.0 | 96.53 |
| 2132.0 | 96.473 |
| 2133.0 | 96.355 |
| 2134.0 | 96.349 |
| 2135.0 | 96.55 |
| 2136.0 | 96.593 |
| 2137.0 | 96.462 |
| 2138.0 | 96.508 |
| 2139.0 | 96.521 |
| 2140.0 | 96.593 |
| 2141.0 | 96.496 |
| 2142.0 | 96.474 |
| 2143.0 | 96.602 |
| 2144.0 | 96.546 |
| 2145.0 | 96.491 |
| 2146.0 | 96.442 |
| 2147.0 | 96.536 |
| 2148.0 | 96.496 |
| 2149.0 | 96.543 |
| 2150.0 | 96.499 |
| 2151.0 | 96.421 |
| 2152.0 | 96.52 |
| 2153.0 | 96.548 |
| 2154.0 | 96.559 |
| 2155.0 | 96.534 |
| 2156.0 | 96.327 |
| 2157.0 | 96.541 |
| 2158.0 | 96.381 |
| 2159.0 | 96.514 |
| 2160.0 | 96.607 |
| 2161.0 | 96.562 |
| 2162.0 | 96.5 |
| 2163.0 | 96.675 |
| 2164.0 | 96.327 |
| 2165.0 | 96.459 |
| 2166.0 | 96.525 |
| 2167.0 | 96.465 |
| 2168.0 | 96.313 |
| 2169.0 | 96.446 |
| 2170.0 | 96.325 |
| 2171.0 | 96.385 |
| 2172.0 | 96.577 |
| 2173.0 | 96.589 |
| 2174.0 | 96.445 |
| 2175.0 | 96.478 |
| 2176.0 | 96.54 |
| 2177.0 | 96.421 |
| 2178.0 | 96.506 |
| 2179.0 | 96.517 |
| 2180.0 | 96.429 |
| 2181.0 | 96.585 |
| 2182.0 | 96.47 |
| 2183.0 | 96.533 |
| 2184.0 | 96.432 |
| 2185.0 | 96.73 |
| 2186.0 | 96.649 |
| 2187.0 | 96.569 |
| 2188.0 | 96.573 |
| 2189.0 | 96.492 |
| 2190.0 | 96.36 |
| 2191.0 | 96.338 |
| 2192.0 | 96.487 |
| 2193.0 | 96.516 |
| 2194.0 | 96.652 |
| 2195.0 | 96.564 |
| 2196.0 | 96.565 |
| 2197.0 | 96.721 |
| 2198.0 | 96.619 |
| 2199.0 | 96.67 |
| 2200.0 | 96.534 |
| 2201.0 | 96.594 |
| 2202.0 | 96.498 |
| 2203.0 | 96.459 |
| 2204.0 | 96.461 |
| 2205.0 | 96.426 |
| 2206.0 | 96.659 |
| 2207.0 | 96.588 |
| 2208.0 | 96.566 |
| 2209.0 | 96.704 |
| 2210.0 | 96.603 |
| 2211.0 | 96.611 |
| 2212.0 | 96.605 |
| 2213.0 | 96.568 |
| 2214.0 | 96.592 |
| 2215.0 | 96.604 |
| 2216.0 | 96.513 |
| 2217.0 | 96.687 |
| 2218.0 | 96.512 |
| 2219.0 | 96.458 |
| 2220.0 | 96.58 |
| 2221.0 | 96.551 |
| 2222.0 | 96.661 |
| 2223.0 | 96.615 |
| 2224.0 | 96.597 |
| 2225.0 | 96.501 |
| 2226.0 | 96.504 |
| 2227.0 | 96.525 |
| 2228.0 | 96.56 |
| 2229.0 | 96.425 |
| 2230.0 | 96.511 |
| 2231.0 | 96.647 |
| 2232.0 | 96.555 |
| 2233.0 | 96.784 |
| 2234.0 | 96.55 |
| 2235.0 | 96.576 |
| 2236.0 | 96.636 |
| 2237.0 | 96.614 |
| 2238.0 | 96.524 |
| 2239.0 | 96.46 |
| 2240.0 | 96.432 |
| 2241.0 | 96.615 |
| 2242.0 | 96.613 |
| 2243.0 | 96.535 |
| 2244.0 | 96.603 |
| 2245.0 | 96.913 |
| 2246.0 | 96.513 |
| 2247.0 | 96.527 |
| 2248.0 | 96.681 |
| 2249.0 | 96.513 |
| 2250.0 | 96.531 |
| 2251.0 | 96.656 |
| 2252.0 | 96.438 |
| 2253.0 | 96.528 |
| 2254.0 | 96.611 |
| 2255.0 | 96.586 |
| 2256.0 | 96.656 |
| 2257.0 | 96.471 |
| 2258.0 | 96.41 |
| 2259.0 | 96.699 |
| 2260.0 | 96.693 |
| 2261.0 | 96.712 |
| 2262.0 | 96.444 |
| 2263.0 | 96.676 |
| 2264.0 | 96.522 |
| 2265.0 | 96.521 |
| 2266.0 | 96.272 |
| 2267.0 | 96.405 |
| 2268.0 | 96.524 |
| 2269.0 | 96.523 |
| 2270.0 | 96.685 |
| 2271.0 | 96.61 |
| 2272.0 | 96.487 |
| 2273.0 | 96.544 |
| 2274.0 | 96.31 |
| 2275.0 | 96.479 |
| 2276.0 | 96.623 |
| 2277.0 | 96.593 |
| 2278.0 | 96.472 |
| 2279.0 | 96.687 |
| 2280.0 | 96.634 |
| 2281.0 | 96.505 |
| 2282.0 | 96.533 |
| 2283.0 | 96.724 |
| 2284.0 | 96.655 |
| 2285.0 | 96.677 |
| 2286.0 | 96.761 |
| 2287.0 | 96.615 |
| 2288.0 | 96.652 |
| 2289.0 | 96.532 |
| 2290.0 | 96.514 |
| 2291.0 | 96.458 |
| 2292.0 | 96.553 |
| 2293.0 | 96.489 |
| 2294.0 | 96.56 |
| 2295.0 | 96.567 |
| 2296.0 | 96.701 |
| 2297.0 | 96.693 |
| 2298.0 | 96.68 |
| 2299.0 | 96.579 |
| 2300.0 | 96.581 |
| 2301.0 | 96.516 |
| 2302.0 | 96.618 |
| 2303.0 | 96.429 |
| 2304.0 | 96.574 |
| 2305.0 | 96.497 |
| 2306.0 | 96.593 |
| 2307.0 | 96.519 |
| 2308.0 | 96.501 |
| 2309.0 | 96.594 |
| 2310.0 | 96.618 |
| 2311.0 | 96.645 |
| 2312.0 | 96.635 |
| 2313.0 | 96.62 |
| 2314.0 | 96.557 |
| 2315.0 | 96.574 |
| 2316.0 | 96.505 |
| 2317.0 | 96.504 |
| 2318.0 | 96.622 |
| 2319.0 | 96.678 |
| 2320.0 | 96.513 |
| 2321.0 | 96.518 |
| 2322.0 | 96.518 |
| 2323.0 | 96.576 |
| 2324.0 | 96.651 |
| 2325.0 | 96.601 |
| 2326.0 | 96.523 |
| 2327.0 | 96.636 |
| 2328.0 | 96.641 |
| 2329.0 | 96.555 |
| 2330.0 | 96.514 |
| 2331.0 | 96.606 |
| 2332.0 | 96.48 |
| 2333.0 | 96.567 |
| 2334.0 | 96.532 |
| 2335.0 | 96.575 |
| 2336.0 | 96.605 |
| 2337.0 | 96.651 |
| 2338.0 | 96.614 |
| 2339.0 | 96.594 |
| 2340.0 | 96.605 |
| 2341.0 | 96.62 |
| 2342.0 | 96.573 |
| 2343.0 | 96.51 |
| 2344.0 | 96.533 |
| 2345.0 | 96.59 |
| 2346.0 | 96.579 |
| 2347.0 | 96.596 |
| 2348.0 | 96.62 |
| 2349.0 | 96.609 |
| 2350.0 | 96.644 |
| 2351.0 | 96.654 |
| 2352.0 | 96.567 |
| 2353.0 | 96.592 |
| 2354.0 | 96.596 |
| 2355.0 | 96.685 |
| 2356.0 | 96.661 |
| 2357.0 | 96.553 |
| 2358.0 | 96.501 |
| 2359.0 | 96.531 |
| 2360.0 | 96.561 |
| 2361.0 | 96.617 |
| 2362.0 | 96.653 |
| 2363.0 | 96.644 |
| 2364.0 | 96.63 |
| 2365.0 | 96.752 |
| 2366.0 | 96.703 |
| 2367.0 | 96.61 |
| 2368.0 | 96.704 |
| 2369.0 | 96.575 |
| 2370.0 | 96.614 |
| 2371.0 | 96.579 |
| 2372.0 | 96.592 |
| 2373.0 | 96.533 |
| 2374.0 | 96.593 |
| 2375.0 | 96.612 |
| 2376.0 | 96.609 |
| 2377.0 | 96.66 |
| 2378.0 | 96.628 |
| 2379.0 | 96.714 |
| 2380.0 | 96.64 |
| 2381.0 | 96.592 |
| 2382.0 | 96.642 |
| 2383.0 | 96.637 |
| 2384.0 | 96.634 |
| 2385.0 | 96.61 |
| 2386.0 | 96.597 |
| 2387.0 | 96.495 |
| 2388.0 | 96.583 |
| 2389.0 | 96.595 |
| 2390.0 | 96.619 |
| 2391.0 | 96.635 |
| 2392.0 | 96.689 |
| 2393.0 | 96.662 |
| 2394.0 | 96.648 |
| 2395.0 | 96.666 |
| 2396.0 | 96.61 |
| 2397.0 | 96.589 |
| 2398.0 | 96.651 |
| 2399.0 | 96.614 |
| 2400.0 | 96.657 |
| 2401.0 | 96.528 |
| 2402.0 | 96.603 |
| 2403.0 | 96.578 |
| 2404.0 | 96.589 |
| 2405.0 | 96.694 |
| 2406.0 | 96.672 |
| 2407.0 | 96.598 |
| 2408.0 | 96.666 |
| 2409.0 | 96.706 |
| 2410.0 | 96.698 |
| 2411.0 | 96.698 |
| 2412.0 | 96.657 |
| 2413.0 | 96.719 |
| 2414.0 | 96.561 |
| 2415.0 | 96.649 |
| 2416.0 | 96.727 |
| 2417.0 | 96.614 |
| 2418.0 | 96.686 |
| 2419.0 | 96.585 |
| 2420.0 | 96.629 |
| 2421.0 | 96.687 |
| 2422.0 | 96.699 |
| 2423.0 | 96.743 |
| 2424.0 | 96.691 |
| 2425.0 | 96.701 |
| 2426.0 | 96.815 |
| 2427.0 | 96.686 |
| 2428.0 | 96.638 |
| 2429.0 | 96.638 |
| 2430.0 | 96.618 |
| 2431.0 | 96.617 |
| 2432.0 | 96.721 |
| 2433.0 | 96.658 |
| 2434.0 | 96.673 |
| 2435.0 | 96.746 |
| 2436.0 | 96.647 |
| 2437.0 | 96.608 |
| 2438.0 | 96.723 |
| 2439.0 | 96.665 |
| 2440.0 | 96.665 |
| 2441.0 | 96.598 |
| 2442.0 | 96.664 |
| 2443.0 | 96.787 |
| 2444.0 | 96.654 |
| 2445.0 | 96.695 |
| 2446.0 | 96.721 |
| 2447.0 | 96.8 |
| 2448.0 | 96.634 |
| 2449.0 | 96.808 |
| 2450.0 | 96.709 |
| 2451.0 | 96.666 |
| 2452.0 | 96.664 |
| 2453.0 | 96.619 |
| 2454.0 | 96.784 |
| 2455.0 | 96.747 |
| 2456.0 | 96.632 |
| 2457.0 | 96.489 |
| 2458.0 | 96.704 |
| 2459.0 | 96.509 |
| 2460.0 | 96.712 |
| 2461.0 | 96.524 |
| 2462.0 | 96.429 |
| 2463.0 | 96.759 |
| 2464.0 | 96.532 |
| 2465.0 | 96.697 |
| 2466.0 | 96.552 |
| 2467.0 | 96.714 |
| 2468.0 | 96.594 |
| 2469.0 | 96.836 |
| 2470.0 | 96.735 |
| 2471.0 | 96.574 |
| 2472.0 | 96.572 |
| 2473.0 | 96.519 |
| 2474.0 | 96.64 |
| 2475.0 | 96.609 |
| 2476.0 | 96.7 |
| 2477.0 | 96.529 |
| 2478.0 | 96.705 |
| 2479.0 | 96.741 |
| 2480.0 | 96.626 |
| 2481.0 | 96.594 |
| 2482.0 | 96.741 |
| 2483.0 | 96.558 |
| 2484.0 | 96.702 |
| 2485.0 | 96.741 |
| 2486.0 | 96.488 |
| 2487.0 | 96.571 |
| 2488.0 | 96.532 |
| 2489.0 | 96.718 |
| 2490.0 | 96.399 |
| 2491.0 | 96.681 |
| 2492.0 | 96.528 |
| 2493.0 | 96.539 |
| 2494.0 | 96.704 |
| 2495.0 | 96.441 |
| 2496.0 | 96.615 |
| 2497.0 | 96.633 |
| 2498.0 | 96.687 |
| 2499.0 | 96.591 |
| 2500.0 | 96.886 |
| 2502.16 | 96.567 |
| 2511.82 | 96.555 |
| 2521.48 | 96.544 |
| 2531.14 | 96.557 |
| 2540.8 | 96.541 |
| 2550.46 | 96.539 |
| 2560.12 | 96.584 |
| 2569.78 | 96.534 |
| 2579.44 | 96.5 |
| 2589.1 | 96.481 |
| 2598.77 | 96.401 |
| 2608.43 | 96.415 |
| 2618.09 | 96.484 |
| 2627.75 | 96.457 |
| 2637.41 | 96.323 |
| 2647.07 | 96.315 |
| 2656.73 | 96.322 |
| 2666.39 | 96.435 |
| 2676.05 | 96.417 |
| 2685.71 | 96.272 |
| 2695.37 | 96.197 |
| 2705.04 | 96.09 |
| 2714.7 | 95.955 |
| 2724.36 | 95.881 |
| 2734.02 | 95.69 |
| 2743.68 | 95.36 |
| 2753.34 | 95.221 |
| 2763.0 | 94.771 |
| 2772.66 | 94.192 |
| 2782.32 | 93.689 |
| 2791.98 | 93.094 |
| 2801.64 | 92.715 |
| 2811.3 | 92.22 |
| 2820.97 | 91.868 |
| 2830.63 | 91.564 |
| 2840.29 | 91.312 |
| 2849.95 | 91.129 |
| 2859.61 | 90.944 |
| 2869.27 | 90.817 |
| 2878.93 | 90.707 |
| 2888.59 | 90.623 |
| 2898.25 | 90.574 |
| 2907.91 | 90.505 |
| 2917.57 | 90.454 |
| 2927.23 | 90.452 |
| 2936.9 | 90.461 |
| 2946.56 | 90.5 |
| 2956.22 | 90.56 |
| 2965.88 | 90.625 |
| 2975.54 | 90.695 |
| 2985.2 | 90.777 |
| 2994.86 | 90.873 |
| 3004.52 | 90.983 |
| 3014.18 | 91.08 |
| 3023.84 | 91.154 |
| 3033.5 | 91.223 |
| 3043.16 | 91.288 |
| 3052.83 | 91.367 |
| 3062.49 | 91.433 |
| 3072.15 | 91.512 |
| 3081.81 | 91.577 |
| 3091.47 | 91.634 |
| 3101.13 | 91.697 |
| 3110.79 | 91.763 |
| 3120.45 | 91.829 |
| 3130.11 | 91.897 |
| 3139.77 | 91.973 |
| 3149.43 | 92.022 |
| 3159.09 | 92.073 |
| 3168.76 | 92.121 |
| 3178.42 | 92.152 |
| 3188.08 | 92.192 |
| 3197.74 | 92.237 |
| 3207.4 | 92.261 |
| 3217.06 | 92.293 |
| 3226.72 | 92.32 |
| 3236.38 | 92.326 |
| 3246.04 | 92.343 |
| 3255.7 | 92.372 |
| 3265.36 | 92.397 |
| 3275.02 | 92.414 |
| 3284.69 | 92.426 |
| 3294.35 | 92.431 |
| 3304.01 | 92.431 |
| 3313.67 | 92.415 |
| 3323.33 | 92.4 |
| 3332.99 | 92.394 |
| 3342.65 | 92.363 |
| 3352.31 | 92.335 |
| 3361.97 | 92.285 |
| 3371.63 | 92.221 |
| 3381.29 | 92.162 |
| 3390.95 | 92.138 |
| 3400.62 | 92.036 |
| 3410.28 | 91.868 |
| 3419.94 | 91.758 |
| 3429.6 | 91.855 |
| 3439.26 | 91.973 |
| 3448.92 | 92.011 |
| 3458.58 | 92.018 |
| 3468.24 | 92.013 |
| 3477.9 | 91.969 |
| 3487.56 | 91.898 |
| 3497.22 | 91.78 |
| 3506.88 | 91.706 |
| 3516.55 | 91.794 |
| 3526.21 | 91.83 |
| 3535.87 | 91.823 |
| 3545.53 | 91.806 |
| 3555.19 | 91.775 |
| 3564.85 | 91.723 |
| 3574.51 | 91.668 |
| 3584.17 | 91.612 |
| 3593.83 | 91.56 |
| 3603.49 | 91.502 |
| 3613.15 | 91.452 |
| 3622.81 | 91.412 |
| 3632.48 | 91.371 |
| 3642.14 | 91.329 |
| 3651.8 | 91.278 |
| 3661.46 | 91.225 |
| 3671.12 | 91.16 |
| 3680.78 | 91.093 |
| 3690.44 | 91.043 |
| 3700.1 | 90.988 |
| 3709.76 | 90.94 |
| 3719.42 | 90.887 |
| 3729.08 | 90.843 |
| 3738.74 | 90.792 |
| 3748.41 | 90.735 |
| 3758.07 | 90.679 |
| 3767.73 | 90.617 |
| 3777.39 | 90.554 |
| 3787.05 | 90.493 |
| 3796.71 | 90.436 |
| 3806.37 | 90.378 |
| 3816.03 | 90.323 |
| 3825.69 | 90.273 |
| 3835.35 | 90.219 |
| 3845.01 | 90.162 |
| 3854.67 | 90.103 |
| 3864.34 | 90.043 |
| 3874.0 | 89.979 |
| 3883.66 | 89.917 |
| 3893.32 | 89.854 |
| 3902.98 | 89.795 |
| 3912.64 | 89.741 |
| 3922.3 | 89.686 |
| 3931.96 | 89.627 |
| 3941.62 | 89.573 |
| 3951.28 | 89.516 |
| 3960.94 | 89.455 |
| 3970.61 | 89.394 |
| 3980.27 | 89.333 |
| 3989.93 | 89.263 |
| 3999.59 | 89.197 |
| 4009.25 | 89.13 |
| 4018.91 | 89.074 |
| 4028.57 | 89.014 |
| 4038.23 | 88.958 |
| 4047.89 | 88.907 |
| 4057.55 | 88.85 |
| 4067.21 | 88.798 |
| 4076.87 | 88.731 |
| 4086.54 | 88.662 |
| 4096.2 | 88.6 |
| 4105.86 | 88.532 |
| 4115.52 | 88.457 |
| 4125.18 | 88.391 |
| 4134.84 | 88.324 |
| 4144.5 | 88.268 |
| 4154.16 | 88.212 |
| 4163.82 | 88.157 |
| 4173.48 | 88.108 |
| 4183.14 | 88.068 |
| 4192.8 | 88.078 |
| 4202.47 | 88.187 |
| 4212.13 | 88.351 |
| 4221.79 | 88.57 |
| 4231.45 | 88.711 |
| 4241.11 | 88.57 |
| 4250.77 | 88.182 |
| 4260.43 | 88.106 |
| 4270.09 | 88.179 |
| 4279.75 | 88.048 |
| 4289.41 | 87.994 |
| 4299.07 | 87.881 |
| 4308.73 | 87.72 |
| 4318.4 | 87.573 |
| 4328.06 | 87.456 |
| 4337.72 | 87.319 |
| 4347.38 | 87.206 |
| 4357.04 | 87.108 |
| 4366.7 | 87.005 |
| 4376.36 | 86.922 |
| 4386.02 | 86.86 |
| 4395.68 | 86.805 |
| 4405.34 | 86.745 |
| 4415.0 | 86.699 |
| 4424.66 | 86.647 |
| 4434.33 | 86.595 |
| 4443.99 | 86.549 |
| 4453.65 | 86.504 |
| 4463.31 | 86.453 |
| 4472.97 | 86.4 |
| 4482.63 | 86.348 |
| 4492.29 | 86.29 |
| 4501.95 | 86.236 |
| 4511.61 | 86.179 |
| 4521.27 | 86.12 |
| 4530.93 | 86.057 |
| 4540.59 | 85.998 |
| 4550.26 | 85.942 |
| 4559.92 | 85.893 |
| 4569.58 | 85.843 |
| 4579.24 | 85.799 |
| 4588.9 | 85.75 |
| 4598.56 | 85.713 |
| 4608.22 | 85.671 |
| 4617.88 | 85.623 |
| 4627.54 | 85.58 |
| 4637.2 | 85.535 |
| 4646.86 | 85.486 |
| 4656.52 | 85.425 |
| 4666.19 | 85.373 |
| 4675.85 | 85.318 |
| 4685.51 | 85.26 |
| 4695.17 | 85.207 |
| 4704.83 | 85.154 |
| 4714.49 | 85.101 |
| 4724.15 | 85.054 |
| 4733.81 | 85 |
| 4743.47 | 84.954 |
| 4753.13 | 84.919 |
| 4762.79 | 84.879 |
| 4772.45 | 84.833 |
| 4782.12 | 84.794 |
| 4791.78 | 84.753 |
| 4801.44 | 84.71 |
| 4811.1 | 84.667 |
| 4820.76 | 84.618 |
| 4830.42 | 84.564 |
| 4840.08 | 84.513 |
| 4849.74 | 84.461 |
| 4859.4 | 84.409 |
| 4869.06 | 84.351 |
| 4878.72 | 84.303 |
| 4888.38 | 84.256 |
| 4898.05 | 84.206 |
| 4907.71 | 84.156 |
| 4917.37 | 84.111 |
| 4927.03 | 84.072 |
| 4936.69 | 84.034 |
| 4946.35 | 83.999 |
| 4956.01 | 83.963 |
| 4965.67 | 83.919 |
| 4975.33 | 83.879 |
| 4984.99 | 83.834 |
| 4994.65 | 83.786 |
| 5004.31 | 83.739 |
| 5013.98 | 83.702 |
| 5023.64 | 83.652 |
| 5033.3 | 83.593 |
| 5042.96 | 83.541 |
| 5052.62 | 83.495 |
| 5062.28 | 83.446 |
| 5071.94 | 83.404 |
| 5081.6 | 83.362 |
| 5091.26 | 83.307 |
| 5100.92 | 83.266 |
| 5110.58 | 83.231 |
| 5120.24 | 83.191 |
| 5129.91 | 83.156 |
| 5139.57 | 83.132 |
| 5149.23 | 83.091 |
| 5158.89 | 83.039 |
| 5168.55 | 83.007 |
| 5178.21 | 82.97 |
| 5187.87 | 82.93 |
| 5197.53 | 82.893 |
| 5207.19 | 82.848 |
| 5216.85 | 82.79 |
| 5226.51 | 82.743 |
| 5236.17 | 82.71 |
| 5245.84 | 82.661 |
| 5255.5 | 82.613 |
| 5265.16 | 82.573 |
| 5274.82 | 82.541 |
| 5284.48 | 82.505 |
| 5294.14 | 82.464 |
| 5303.8 | 82.418 |
| 5313.46 | 82.379 |
| 5323.12 | 82.341 |
| 5332.78 | 82.305 |
| 5342.44 | 82.289 |
| 5352.11 | 82.252 |
| 5361.77 | 82.188 |
| 5371.43 | 82.155 |
| 5381.09 | 82.117 |
| 5390.75 | 82.075 |
| 5400.41 | 82.043 |
| 5410.07 | 82.023 |
| 5419.73 | 81.987 |
| 5429.39 | 81.91 |
| 5439.05 | 81.871 |
| 5448.71 | 81.841 |
| 5458.37 | 81.826 |
| 5468.04 | 81.782 |
| 5477.7 | 81.73 |
| 5487.36 | 81.681 |
| 5497.02 | 81.646 |
| 5506.68 | 81.616 |
| 5516.34 | 81.589 |
| 5526.0 | 81.546 |
| 5535.66 | 81.505 |
| 5545.32 | 81.486 |
| 5554.98 | 81.449 |
| 5564.64 | 81.411 |
| 5574.3 | 81.388 |
| 5583.97 | 81.32 |
| 5593.63 | 81.27 |
| 5603.29 | 81.244 |
| 5612.95 | 81.205 |
| 5622.61 | 81.163 |
| 5632.27 | 81.147 |
| 5641.93 | 81.113 |
| 5651.59 | 81.035 |
| 5661.25 | 80.987 |
| 5670.91 | 80.961 |
| 5680.57 | 80.913 |
| 5690.23 | 80.861 |
| 5699.9 | 80.825 |
| 5709.56 | 80.792 |
| 5719.22 | 80.717 |
| 5728.88 | 80.655 |
| 5738.54 | 80.62 |
| 5748.2 | 80.582 |
| 5757.86 | 80.568 |
| 5767.52 | 80.534 |
| 5777.18 | 80.458 |
| 5786.84 | 80.416 |
| 5796.5 | 80.391 |
| 5806.16 | 80.376 |
| 5815.83 | 80.364 |
| 5825.49 | 80.281 |
| 5835.15 | 80.173 |
| 5844.81 | 80.124 |
| 5854.47 | 80.09 |
| 5864.13 | 80.038 |
| 5873.79 | 79.993 |
| 5883.45 | 79.926 |
| 5893.11 | 79.817 |
| 5902.77 | 79.721 |
| 5912.43 | 79.679 |
| 5922.09 | 79.669 |
| 5931.76 | 79.64 |
| 5941.42 | 79.515 |
| 5951.08 | 79.415 |
| 5960.74 | 79.371 |
| 5970.4 | 79.296 |
| 5980.06 | 79.214 |
| 5989.72 | 79.119 |
| 5999.38 | 79.023 |
| 6009.04 | 78.962 |
| 6018.7 | 78.875 |
| 6028.36 | 78.807 |
| 6038.02 | 78.795 |
| 6047.69 | 78.717 |
| 6057.35 | 78.575 |
| 6067.01 | 78.532 |
| 6076.67 | 78.459 |
| 6086.33 | 78.398 |
| 6095.99 | 78.399 |
| 6105.65 | 78.396 |
| 6115.31 | 78.332 |
| 6124.97 | 78.283 |
| 6134.63 | 78.294 |
| 6144.29 | 78.306 |
| 6153.95 | 78.301 |
| 6163.62 | 78.295 |
| 6173.28 | 78.315 |
| 6182.94 | 78.345 |
| 6192.6 | 78.354 |
| 6202.26 | 78.385 |
| 6211.92 | 78.434 |
| 6221.58 | 78.471 |
| 6231.24 | 78.501 |
| 6240.9 | 78.527 |
| 6250.56 | 78.547 |
| 6260.22 | 78.562 |
| 6269.88 | 78.568 |
| 6279.55 | 78.57 |
| 6289.21 | 78.571 |
| 6298.87 | 78.57 |
| 6308.53 | 78.57 |
| 6318.19 | 78.575 |
| 6327.85 | 78.589 |
| 6337.51 | 78.597 |
| 6347.17 | 78.568 |
| 6356.83 | 78.547 |
| 6366.49 | 78.541 |
| 6376.15 | 78.516 |
| 6385.81 | 78.495 |
| 6395.48 | 78.511 |
| 6405.14 | 78.544 |
| 6414.8 | 78.522 |
| 6424.46 | 78.447 |
| 6434.12 | 78.424 |
| 6443.78 | 78.426 |
| 6453.44 | 78.425 |
| 6463.1 | 78.432 |
| 6472.76 | 78.456 |
| 6482.42 | 78.479 |
| 6492.08 | 78.435 |
| 6501.74 | 78.366 |
| 6511.41 | 78.352 |
| 6521.07 | 78.357 |
| 6530.73 | 78.353 |
| 6540.39 | 78.364 |
| 6550.05 | 78.378 |
| 6559.71 | 78.385 |
| 6569.37 | 78.379 |
| 6579.03 | 78.353 |
| 6588.69 | 78.324 |
| 6598.35 | 78.302 |
| 6608.01 | 78.298 |
| 6617.68 | 78.318 |
| 6627.34 | 78.331 |
| 6637.0 | 78.273 |
| 6646.66 | 78.188 |
| 6656.32 | 78.163 |
| 6665.98 | 78.166 |
| 6675.64 | 78.145 |
| 6685.3 | 78.104 |
| 6694.96 | 78.08 |
| 6704.62 | 78.071 |
| 6714.28 | 78.038 |
| 6723.94 | 77.985 |
| 6733.61 | 77.949 |
| 6743.27 | 77.932 |
| 6752.93 | 77.916 |
| 6762.59 | 77.903 |
| 6772.25 | 77.893 |
| 6781.91 | 77.861 |
| 6791.57 | 77.79 |
| 6801.23 | 77.725 |
| 6810.89 | 77.701 |
| 6820.55 | 77.69 |
| 6830.21 | 77.67 |
| 6839.87 | 77.665 |
| 6849.54 | 77.681 |
| 6859.2 | 77.672 |
| 6868.86 | 77.614 |
| 6878.52 | 77.579 |
| 6888.18 | 77.582 |
| 6897.84 | 77.589 |
| 6907.5 | 77.577 |
| 6917.16 | 77.554 |
| 6926.82 | 77.538 |
| 6936.48 | 77.536 |
| 6946.14 | 77.539 |
| 6955.8 | 77.527 |
| 6965.47 | 77.495 |
| 6975.13 | 77.469 |
| 6984.79 | 77.454 |
| 6994.45 | 77.438 |
| 7004.11 | 77.421 |
| 7013.77 | 77.411 |
| 7023.43 | 77.406 |
| 7033.09 | 77.403 |
| 7042.75 | 77.394 |
| 7052.41 | 77.37 |
| 7062.07 | 77.343 |
| 7071.73 | 77.323 |
| 7081.4 | 77.304 |
| 7091.06 | 77.285 |
| 7100.72 | 77.273 |
| 7110.38 | 77.263 |
| 7120.04 | 77.249 |
| 7129.7 | 77.237 |
| 7139.36 | 77.229 |
| 7149.02 | 77.217 |
| 7158.68 | 77.194 |
| 7168.34 | 77.163 |
| 7178.0 | 77.134 |
| 7187.66 | 77.118 |
| 7197.33 | 77.108 |
| 7206.99 | 77.087 |
| 7216.65 | 77.056 |
| 7226.31 | 77.028 |
| 7235.97 | 77.011 |
| 7245.63 | 77.001 |
| 7255.29 | 76.994 |
| 7264.95 | 76.982 |
| 7274.61 | 76.963 |
| 7284.27 | 76.94 |
| 7293.93 | 76.924 |
| 7303.59 | 76.918 |
| 7313.26 | 76.916 |
| 7322.92 | 76.915 |
| 7332.58 | 76.908 |
| 7342.24 | 76.889 |
| 7351.9 | 76.866 |
| 7361.56 | 76.85 |
| 7371.22 | 76.839 |
| 7380.88 | 76.829 |
| 7390.54 | 76.818 |
| 7400.2 | 76.805 |
| 7409.86 | 76.791 |
| 7419.52 | 76.775 |
| 7429.19 | 76.758 |
| 7438.85 | 76.744 |
| 7448.51 | 76.736 |
| 7458.17 | 76.728 |
| 7467.83 | 76.711 |
| 7477.49 | 76.687 |
| 7487.15 | 76.661 |
| 7496.81 | 76.639 |
| 7506.47 | 76.622 |
| 7516.13 | 76.605 |
| 7525.79 | 76.588 |
| 7535.45 | 76.571 |
| 7545.12 | 76.556 |
| 7554.78 | 76.541 |
| 7564.44 | 76.525 |
| 7574.1 | 76.509 |
| 7583.76 | 76.491 |
| 7593.42 | 76.473 |
| 7603.08 | 76.455 |
| 7612.74 | 76.439 |
| 7622.4 | 76.422 |
| 7632.06 | 76.404 |
| 7641.72 | 76.385 |
| 7651.38 | 76.366 |
| 7661.05 | 76.35 |
| 7670.71 | 76.337 |
| 7680.37 | 76.327 |
| 7690.03 | 76.316 |
| 7699.69 | 76.304 |
| 7709.35 | 76.29 |
| 7719.01 | 76.276 |
| 7728.67 | 76.262 |
| 7738.33 | 76.247 |
| 7747.99 | 76.233 |
| 7757.65 | 76.219 |
| 7767.31 | 76.204 |
| 7776.98 | 76.189 |
| 7786.64 | 76.174 |
| 7796.3 | 76.159 |
| 7805.96 | 76.145 |
| 7815.62 | 76.13 |
| 7825.28 | 76.115 |
| 7834.94 | 76.099 |
| 7844.6 | 76.085 |
| 7854.26 | 76.071 |
| 7863.92 | 76.056 |
| 7873.58 | 76.042 |
| 7883.24 | 76.026 |
| 7892.91 | 76.01 |
| 7902.57 | 75.993 |
| 7912.23 | 75.976 |
| 7921.89 | 75.959 |
| 7931.55 | 75.942 |
| 7941.21 | 75.924 |
| 7950.87 | 75.908 |
| 7960.53 | 75.894 |
| 7970.19 | 75.881 |
| 7979.85 | 75.868 |
| 7989.51 | 75.852 |
| 7999.18 | 75.833 |
| 8008.84 | 75.814 |
| 8018.5 | 75.796 |
| 8028.16 | 75.779 |
| 8037.82 | 75.765 |
| 8047.48 | 75.75 |
| 8057.14 | 75.736 |
| 8066.8 | 75.723 |
| 8076.46 | 75.71 |
| 8086.12 | 75.7 |
| 8095.78 | 75.689 |
| 8105.44 | 75.678 |
| 8115.11 | 75.668 |
| 8124.77 | 75.66 |
| 8134.43 | 75.655 |
| 8144.09 | 75.65 |
| 8153.75 | 75.646 |
| 8163.41 | 75.639 |
| 8173.07 | 75.632 |
| 8182.73 | 75.625 |
| 8192.39 | 75.618 |
| 8202.05 | 75.61 |
| 8211.71 | 75.6 |
| 8221.37 | 75.589 |
| 8231.04 | 75.579 |
| 8240.7 | 75.571 |
| 8250.36 | 75.565 |
| 8260.02 | 75.558 |
| 8269.68 | 75.551 |
| 8279.34 | 75.544 |
| 8289.0 | 75.537 |
| 8298.66 | 75.53 |
| 8308.32 | 75.522 |
| 8317.98 | 75.514 |
| 8327.64 | 75.506 |
| 8337.3 | 75.498 |
| 8346.97 | 75.49 |
| 8356.63 | 75.48 |
| 8366.29 | 75.469 |
| 8375.95 | 75.456 |
| 8385.61 | 75.44 |
| 8395.27 | 75.425 |
| 8404.93 | 75.41 |
| 8414.59 | 75.399 |
| 8424.25 | 75.389 |
| 8433.91 | 75.379 |
| 8443.57 | 75.367 |
| 8453.23 | 75.353 |
| 8462.9 | 75.337 |
| 8472.56 | 75.32 |
| 8482.22 | 75.302 |
| 8491.88 | 75.283 |
| 8501.54 | 75.265 |
| 8511.2 | 75.248 |
| 8520.86 | 75.234 |
| 8530.52 | 75.221 |
| 8540.18 | 75.21 |
| 8549.84 | 75.2 |
| 8559.5 | 75.19 |
| 8569.16 | 75.178 |
| 8578.83 | 75.164 |
| 8588.49 | 75.15 |
| 8598.15 | 75.136 |
| 8607.81 | 75.122 |
| 8617.47 | 75.11 |
| 8627.13 | 75.099 |
| 8636.79 | 75.091 |
| 8646.45 | 75.085 |
| 8656.11 | 75.079 |
| 8665.77 | 75.072 |
| 8675.43 | 75.063 |
| 8685.09 | 75.052 |
| 8694.76 | 75.041 |
| 8704.42 | 75.03 |
| 8714.08 | 75.02 |
| 8723.74 | 75.011 |
| 8733.4 | 75.003 |
| 8743.06 | 74.996 |
| 8752.72 | 74.989 |
| 8762.38 | 74.983 |
| 8772.04 | 74.978 |
| 8781.7 | 74.973 |
| 8791.36 | 74.969 |
| 8801.02 | 74.964 |
| 8810.69 | 74.956 |
| 8820.35 | 74.946 |
| 8830.01 | 74.933 |
| 8839.67 | 74.919 |
| 8849.33 | 74.905 |
| 8858.99 | 74.891 |
| 8868.65 | 74.879 |
| 8878.31 | 74.867 |
| 8887.97 | 74.856 |
| 8897.63 | 74.844 |
| 8907.29 | 74.833 |
| 8916.95 | 74.821 |
| 8926.62 | 74.808 |
| 8936.28 | 74.794 |
| 8945.94 | 74.778 |
| 8955.6 | 74.761 |
| 8965.26 | 74.743 |
| 8974.92 | 74.725 |
| 8984.58 | 74.71 |
| 8994.24 | 74.697 |
| 9003.9 | 74.686 |
| 9013.56 | 74.677 |
| 9023.22 | 74.667 |
| 9032.88 | 74.656 |
| 9042.55 | 74.645 |
| 9052.21 | 74.635 |
| 9061.87 | 74.625 |
| 9071.53 | 74.614 |
| 9081.19 | 74.603 |
| 9090.85 | 74.589 |
| 9100.51 | 74.574 |
| 9110.17 | 74.558 |
| 9119.83 | 74.543 |
| 9129.49 | 74.527 |
| 9139.15 | 74.513 |
| 9148.81 | 74.5 |
| 9158.48 | 74.49 |
| 9168.14 | 74.482 |
| 9177.8 | 74.475 |
| 9187.46 | 74.468 |
| 9197.12 | 74.461 |
| 9206.78 | 74.453 |
| 9216.44 | 74.443 |
| 9226.1 | 74.433 |
| 9235.76 | 74.426 |
| 9245.42 | 74.42 |
| 9255.08 | 74.415 |
| 9264.75 | 74.41 |
| 9274.41 | 74.404 |
| 9284.07 | 74.396 |
| 9293.73 | 74.387 |
| 9303.39 | 74.376 |
| 9313.05 | 74.365 |
| 9322.71 | 74.354 |
| 9332.37 | 74.344 |
| 9342.03 | 74.333 |
| 9351.69 | 74.326 |
| 9361.35 | 74.318 |
| 9371.01 | 74.312 |
| 9380.68 | 74.306 |
| 9390.34 | 74.299 |
| 9400.0 | 74.292 |
| 9409.66 | 74.284 |
| 9419.32 | 74.278 |
| 9428.98 | 74.272 |
| 9438.64 | 74.264 |
| 9448.3 | 74.255 |
| 9457.96 | 74.244 |
| 9467.62 | 74.232 |
| 9477.28 | 74.22 |
| 9486.94 | 74.21 |
| 9496.61 | 74.201 |
| 9506.27 | 74.192 |
| 9515.93 | 74.182 |
| 9525.59 | 74.17 |
| 9535.25 | 74.156 |
| 9544.91 | 74.141 |
| 9554.57 | 74.127 |
| 9564.23 | 74.113 |
| 9573.89 | 74.101 |
| 9583.55 | 74.09 |
| 9593.21 | 74.08 |
| 9602.87 | 74.07 |
| 9612.54 | 74.059 |
| 9622.2 | 74.048 |
| 9631.86 | 74.036 |
| 9641.52 | 74.024 |
| 9651.18 | 74.014 |
| 9660.84 | 74.004 |
| 9670.5 | 73.994 |
| 9680.16 | 73.983 |
| 9689.82 | 73.972 |
| 9699.48 | 73.961 |
| 9709.14 | 73.95 |
| 9718.8 | 73.939 |
| 9728.47 | 73.928 |
| 9738.13 | 73.916 |
| 9747.79 | 73.904 |
| 9757.45 | 73.891 |
| 9767.11 | 73.878 |
| 9776.77 | 73.866 |
| 9786.43 | 73.854 |
| 9796.09 | 73.844 |
| 9805.75 | 73.834 |
| 9815.41 | 73.824 |
| 9825.07 | 73.814 |
| 9834.73 | 73.803 |
| 9844.4 | 73.793 |
| 9854.06 | 73.783 |
| 9863.72 | 73.772 |
| 9873.38 | 73.761 |
| 9883.04 | 73.748 |
| 9892.7 | 73.735 |
| 9902.36 | 73.723 |
| 9912.02 | 73.712 |
| 9921.68 | 73.703 |
| 9931.34 | 73.696 |
| 9941.0 | 73.689 |
| 9950.66 | 73.682 |
| 9960.33 | 73.673 |
| 9969.99 | 73.664 |
| 9979.65 | 73.651 |
| 9989.31 | 73.638 |
| 9998.97 | 73.623 |
| 10008.6 | 73.606 |
| 10018.3 | 73.59 |
| 10028.0 | 73.573 |
| 10037.6 | 73.56 |
| 10047.3 | 73.547 |
| 10056.9 | 73.537 |
| 10066.6 | 73.529 |
| 10076.3 | 73.521 |
| 10085.9 | 73.513 |
| 10095.6 | 73.503 |
| 10105.2 | 73.492 |
| 10114.9 | 73.479 |
| 10124.6 | 73.466 |
| 10134.2 | 73.453 |
| 10143.9 | 73.439 |
| 10153.5 | 73.426 |
| 10163.2 | 73.413 |
| 10172.9 | 73.399 |
| 10182.5 | 73.385 |
| 10192.2 | 73.372 |
| 10201.8 | 73.359 |
| 10211.5 | 73.347 |
| 10221.2 | 73.335 |
| 10230.8 | 73.323 |
| 10240.5 | 73.309 |
| 10250.2 | 73.295 |
| 10259.8 | 73.279 |
| 10269.5 | 73.263 |
| 10279.1 | 73.246 |
| 10288.8 | 73.23 |
| 10298.5 | 73.216 |
| 10308.1 | 73.201 |
| 10317.8 | 73.191 |
| 10327.4 | 73.181 |
| 10337.1 | 73.174 |
| 10346.8 | 73.168 |
| 10356.4 | 73.161 |
| 10366.1 | 73.154 |
| 10375.7 | 73.146 |
| 10385.4 | 73.137 |
| 10395.1 | 73.127 |
| 10404.7 | 73.118 |
| 10414.4 | 73.109 |
| 10424.0 | 73.101 |
| 10433.7 | 73.094 |
| 10443.4 | 73.086 |
| 10453.0 | 73.079 |
| 10462.7 | 73.069 |
| 10472.3 | 73.059 |
| 10482.0 | 73.048 |
| 10491.7 | 73.036 |
| 10501.3 | 73.025 |
| 10511.0 | 73.014 |
| 10520.7 | 73.005 |
| 10530.3 | 72.997 |
| 10540.0 | 72.989 |
| 10549.6 | 72.98 |
| 10559.3 | 72.97 |
| 10569.0 | 72.959 |
| 10578.6 | 72.947 |
| 10588.3 | 72.936 |
| 10597.9 | 72.925 |
| 10607.6 | 72.916 |
| 10617.3 | 72.909 |
| 10626.9 | 72.903 |
| 10636.6 | 72.895 |
| 10646.2 | 72.888 |
| 10655.9 | 72.876 |
| 10665.6 | 72.863 |
| 10675.2 | 72.847 |
| 10684.9 | 72.829 |
| 10694.5 | 72.812 |
| 10704.2 | 72.797 |
| 10713.9 | 72.782 |
| 10723.5 | 72.773 |
| 10733.2 | 72.764 |
| 10742.9 | 72.756 |
| 10752.5 | 72.748 |
| 10762.2 | 72.74 |
| 10771.8 | 72.731 |
| 10781.5 | 72.723 |
| 10791.2 | 72.715 |
| 10800.8 | 72.707 |
| 10810.5 | 72.7 |
| 10820.1 | 72.694 |
| 10829.8 | 72.686 |
| 10839.5 | 72.677 |
| 10849.1 | 72.668 |
| 10858.8 | 72.656 |
| 10868.4 | 72.643 |
| 10878.1 | 72.629 |
| 10887.8 | 72.615 |
| 10897.4 | 72.6 |
| 10907.1 | 72.584 |
| 10916.7 | 72.568 |
| 10926.4 | 72.551 |
| 10936.1 | 72.534 |
| 10945.7 | 72.517 |
| 10955.4 | 72.5 |
| 10965.1 | 72.484 |
| 10974.7 | 72.469 |
| 10984.4 | 72.454 |
| 10994.0 | 72.441 |
| 11003.7 | 72.429 |
| 11013.4 | 72.417 |
| 11023.0 | 72.407 |
| 11032.7 | 72.396 |
| 11042.3 | 72.386 |
| 11052.0 | 72.375 |
| 11061.7 | 72.365 |
| 11071.3 | 72.354 |
| 11081.0 | 72.344 |
| 11090.6 | 72.334 |
| 11100.3 | 72.324 |
| 11110.0 | 72.315 |
| 11119.6 | 72.305 |
| 11129.3 | 72.295 |
| 11138.9 | 72.284 |
| 11148.6 | 72.273 |
| 11158.3 | 72.262 |
| 11167.9 | 72.251 |
| 11177.6 | 72.241 |
| 11187.3 | 72.23 |
| 11196.9 | 72.22 |
| 11206.6 | 72.208 |
| 11216.2 | 72.197 |
| 11225.9 | 72.184 |
| 11235.6 | 72.171 |
| 11245.2 | 72.158 |
| 11254.9 | 72.145 |
| 11264.5 | 72.133 |
| 11274.2 | 72.122 |
| 11283.9 | 72.113 |
| 11293.5 | 72.105 |
| 11303.2 | 72.096 |
| 11312.8 | 72.087 |
| 11322.5 | 72.079 |
| 11332.2 | 72.067 |
| 11341.8 | 72.056 |
| 11351.5 | 72.045 |
| 11361.1 | 72.033 |
| 11370.8 | 72.022 |
| 11380.5 | 72.013 |
| 11390.1 | 72.004 |
| 11399.8 | 71.995 |
| 11409.5 | 71.988 |
| 11419.1 | 71.981 |
| 11428.8 | 71.976 |
| 11438.4 | 71.97 |
| 11448.1 | 71.966 |
| 11457.8 | 71.962 |
| 11467.4 | 71.959 |
| 11477.1 | 71.954 |
| 11486.7 | 71.95 |
| 11496.4 | 71.945 |
| 11506.1 | 71.938 |
| 11515.7 | 71.93 |
| 11525.4 | 71.922 |
| 11535.0 | 71.912 |
| 11544.7 | 71.903 |
| 11554.4 | 71.894 |
| 11564.0 | 71.886 |
| 11573.7 | 71.878 |
| 11583.3 | 71.872 |
| 11593.0 | 71.866 |
| 11602.7 | 71.861 |
| 11612.3 | 71.856 |
| 11622.0 | 71.851 |
| 11631.7 | 71.845 |
| 11641.3 | 71.839 |
| 11651.0 | 71.833 |
| 11660.6 | 71.828 |
| 11670.3 | 71.822 |
| 11680.0 | 71.817 |
| 11689.6 | 71.812 |
| 11699.3 | 71.806 |
| 11708.9 | 71.8 |
| 11718.6 | 71.793 |
| 11728.3 | 71.786 |
| 11737.9 | 71.778 |
| 11747.6 | 71.769 |
| 11757.2 | 71.761 |
| 11766.9 | 71.753 |
| 11776.6 | 71.744 |
| 11786.2 | 71.736 |
| 11795.9 | 71.729 |
| 11805.5 | 71.722 |
| 11815.2 | 71.715 |
| 11824.9 | 71.709 |
| 11834.5 | 71.703 |
| 11844.2 | 71.698 |
| 11853.8 | 71.692 |
| 11863.5 | 71.687 |
| 11873.2 | 71.682 |
| 11882.8 | 71.677 |
| 11892.5 | 71.673 |
| 11902.2 | 71.667 |
| 11911.8 | 71.662 |
| 11921.5 | 71.656 |
| 11931.1 | 71.649 |
| 11940.8 | 71.642 |
| 11950.5 | 71.636 |
| 11960.1 | 71.629 |
| 11969.8 | 71.623 |
| 11979.4 | 71.616 |
| 11989.1 | 71.611 |
| 11998.8 | 71.605 |
| 12008.4 | 71.599 |
| 12018.1 | 71.592 |
| 12027.7 | 71.586 |
| 12037.4 | 71.578 |
| 12047.1 | 71.57 |
| 12056.7 | 71.562 |
| 12066.4 | 71.554 |
| 12076.0 | 71.548 |
| 12085.7 | 71.541 |
| 12095.4 | 71.538 |
| 12105.0 | 71.536 |
| 12114.7 | 71.534 |
| 12124.4 | 71.533 |
| 12134.0 | 71.532 |
| 12143.7 | 71.532 |
| 12153.3 | 71.529 |
| 12163.0 | 71.525 |
| 12172.7 | 71.522 |
| 12182.3 | 71.516 |
| 12192.0 | 71.51 |
| 12201.6 | 71.503 |
| 12211.3 | 71.497 |
| 12221.0 | 71.491 |
| 12230.6 | 71.485 |
| 12240.3 | 71.479 |
| 12249.9 | 71.474 |
| 12259.6 | 71.469 |
| 12269.3 | 71.464 |
| 12278.9 | 71.46 |
| 12288.6 | 71.455 |
| 12298.2 | 71.452 |
| 12307.9 | 71.449 |
| 12317.6 | 71.446 |
| 12327.2 | 71.444 |
| 12336.9 | 71.443 |
| 12346.6 | 71.441 |
| 12356.2 | 71.44 |
| 12365.9 | 71.438 |
| 12375.5 | 71.436 |
| 12385.2 | 71.432 |
| 12394.9 | 71.428 |
| 12404.5 | 71.424 |
| 12414.2 | 71.419 |
| 12423.8 | 71.414 |
| 12433.5 | 71.409 |
| 12443.2 | 71.404 |
| 12452.8 | 71.4 |
| 12462.5 | 71.395 |
| 12472.1 | 71.391 |
| 12481.8 | 71.385 |
| 12491.5 | 71.38 |
| 12501.1 | 71.374 |
| 12510.8 | 71.366 |
| 12520.4 | 71.358 |
| 12530.1 | 71.351 |
| 12539.8 | 71.343 |
| 12549.4 | 71.335 |
| 12559.1 | 71.329 |
| 12568.8 | 71.324 |
| 12578.4 | 71.318 |
| 12588.1 | 71.313 |
| 12597.7 | 71.31 |
| 12607.4 | 71.306 |
| 12617.1 | 71.303 |
| 12626.7 | 71.298 |
| 12636.4 | 71.294 |
| 12646.0 | 71.289 |
| 12655.7 | 71.282 |
| 12665.4 | 71.274 |
| 12675.0 | 71.266 |
| 12684.7 | 71.256 |
| 12694.3 | 71.246 |
| 12704.0 | 71.235 |
| 12713.7 | 71.225 |
| 12723.3 | 71.214 |
| 12733.0 | 71.204 |
| 12742.6 | 71.194 |
| 12752.3 | 71.185 |
| 12762.0 | 71.176 |
| 12771.6 | 71.167 |
| 12781.3 | 71.16 |
| 12791.0 | 71.153 |
| 12800.6 | 71.146 |
| 12810.3 | 71.141 |
| 12819.9 | 71.137 |
| 12829.6 | 71.133 |
| 12839.3 | 71.131 |
| 12848.9 | 71.129 |
| 12858.6 | 71.127 |
| 12868.2 | 71.126 |
| 12877.9 | 71.122 |
| 12887.6 | 71.119 |
| 12897.2 | 71.116 |
| 12906.9 | 71.11 |
| 12916.5 | 71.104 |
| 12926.2 | 71.097 |
| 12935.9 | 71.09 |
| 12945.5 | 71.083 |
| 12955.2 | 71.075 |
| 12964.8 | 71.068 |
| 12974.5 | 71.062 |
| 12984.2 | 71.057 |
| 12993.8 | 71.052 |
| 13003.5 | 71.049 |
| 13013.2 | 71.048 |
| 13022.8 | 71.046 |
| 13032.5 | 71.045 |
| 13042.1 | 71.045 |
| 13051.8 | 71.044 |
| 13061.5 | 71.044 |
| 13071.1 | 71.043 |
| 13080.8 | 71.042 |
| 13090.4 | 71.041 |
| 13100.1 | 71.038 |
| 13109.8 | 71.034 |
| 13119.4 | 71.031 |
| 13129.1 | 71.026 |
| 13138.7 | 71.021 |
| 13148.4 | 71.015 |
| 13158.1 | 71.009 |
| 13167.7 | 71.003 |
| 13177.4 | 70.997 |
| 13187.0 | 70.992 |
| 13196.7 | 70.986 |
| 13206.4 | 70.981 |
| 13216.0 | 70.975 |
| 13225.7 | 70.97 |
| 13235.4 | 70.964 |
| 13245.0 | 70.958 |
| 13254.7 | 70.952 |
| 13264.3 | 70.946 |
| 13274.0 | 70.939 |
| 13283.7 | 70.933 |
| 13293.3 | 70.927 |
| 13303.0 | 70.921 |
| 13312.6 | 70.915 |
| 13322.3 | 70.909 |
| 13332.0 | 70.903 |
| 13341.6 | 70.896 |
| 13351.3 | 70.889 |
| 13360.9 | 70.881 |
| 13370.6 | 70.873 |
| 13380.3 | 70.863 |
| 13389.9 | 70.853 |
| 13399.6 | 70.844 |
| 13409.2 | 70.833 |
| 13418.9 | 70.822 |
| 13428.6 | 70.811 |
| 13438.2 | 70.801 |
| 13447.9 | 70.792 |
| 13457.5 | 70.782 |
| 13467.2 | 70.773 |
| 13476.9 | 70.764 |
| 13486.5 | 70.756 |
| 13496.2 | 70.748 |
| 13505.9 | 70.74 |
| 13515.5 | 70.73 |
| 13525.2 | 70.72 |
| 13534.8 | 70.71 |
| 13544.5 | 70.7 |
| 13554.2 | 70.688 |
| 13563.8 | 70.677 |
| 13573.5 | 70.666 |
| 13583.1 | 70.655 |
| 13592.8 | 70.645 |
| 13602.5 | 70.635 |
| 13612.1 | 70.624 |
| 13621.8 | 70.615 |
| 13631.4 | 70.605 |
| 13641.1 | 70.595 |
| 13650.8 | 70.586 |
| 13660.4 | 70.577 |
| 13670.1 | 70.568 |
| 13679.7 | 70.559 |
| 13689.4 | 70.552 |
| 13699.1 | 70.545 |
| 13708.7 | 70.538 |
| 13718.4 | 70.531 |
| 13728.1 | 70.524 |
| 13737.7 | 70.516 |
| 13747.4 | 70.509 |
| 13757.0 | 70.501 |
| 13766.7 | 70.49 |
| 13776.4 | 70.479 |
| 13786.0 | 70.467 |
| 13795.7 | 70.456 |
| 13805.3 | 70.443 |
| 13815.0 | 70.431 |
| 13824.7 | 70.419 |
| 13834.3 | 70.407 |
| 13844.0 | 70.397 |
| 13853.6 | 70.386 |
| 13863.3 | 70.375 |
| 13873.0 | 70.365 |
| 13882.6 | 70.354 |
| 13892.3 | 70.344 |
| 13901.9 | 70.333 |
| 13911.6 | 70.323 |
| 13921.3 | 70.313 |
| 13930.9 | 70.302 |
| 13940.6 | 70.292 |
| 13950.3 | 70.284 |
| 13959.9 | 70.275 |
| 13969.6 | 70.267 |
| 13979.2 | 70.259 |
| 13988.9 | 70.251 |
| 13998.6 | 70.243 |
| 14008.2 | 70.235 |
| 14017.9 | 70.227 |
| 14027.5 | 70.216 |
| 14037.2 | 70.205 |
| 14046.9 | 70.195 |
| 14056.5 | 70.183 |
| 14066.2 | 70.171 |
| 14075.8 | 70.158 |
| 14085.5 | 70.146 |
| 14095.2 | 70.134 |
| 14104.8 | 70.122 |
| 14114.5 | 70.11 |
| 14124.1 | 70.098 |
| 14133.8 | 70.084 |
| 14143.5 | 70.069 |
| 14153.1 | 70.053 |
| 14162.8 | 70.038 |
| 14172.5 | 70.02 |
| 14182.1 | 69.998 |
| 14191.8 | 69.977 |
| 14201.4 | 69.956 |
| 14211.1 | 69.936 |
| 14220.8 | 69.915 |
| 14230.4 | 69.895 |
| 14240.1 | 69.875 |
| 14249.7 | 69.857 |
| 14259.4 | 69.843 |
| 14269.1 | 69.829 |
| 14278.7 | 69.815 |
| 14288.4 | 69.802 |
| 14298.0 | 69.792 |
| 14307.7 | 69.781 |
| 14317.4 | 69.771 |
| 14327.0 | 69.76 |
| 14336.7 | 69.747 |
| 14346.3 | 69.734 |
| 14356.0 | 69.722 |
| 14365.7 | 69.708 |
| 14375.3 | 69.691 |
| 14385.0 | 69.674 |
| 14394.7 | 69.657 |
| 14404.3 | 69.64 |
| 14414.0 | 69.618 |
| 14423.6 | 69.595 |
| 14433.3 | 69.573 |
| 14443.0 | 69.551 |
| 14452.6 | 69.523 |
| 14462.3 | 69.495 |
| 14471.9 | 69.466 |
| 14481.6 | 69.438 |
| 14491.3 | 69.408 |
| 14500.9 | 69.377 |
| 14510.6 | 69.346 |
| 14520.2 | 69.315 |
| 14529.9 | 69.287 |
| 14539.6 | 69.262 |
| 14549.2 | 69.236 |
| 14558.9 | 69.211 |
| 14568.5 | 69.188 |
| 14578.2 | 69.171 |
| 14587.9 | 69.154 |
| 14597.5 | 69.138 |
| 14607.2 | 69.121 |
| 14616.9 | 69.106 |
| 14626.5 | 69.092 |
| 14636.2 | 69.077 |
| 14645.8 | 69.062 |
| 14655.5 | 69.041 |
| 14665.2 | 69.017 |
| 14674.8 | 68.993 |
| 14684.5 | 68.969 |
| 14694.1 | 68.939 |
| 14703.8 | 68.9 |
| 14713.5 | 68.862 |
| 14723.1 | 68.824 |
| 14732.8 | 68.785 |
| 14742.4 | 68.739 |
| 14752.1 | 68.693 |
| 14761.8 | 68.647 |
| 14771.4 | 68.601 |
| 14781.1 | 68.559 |
| 14790.7 | 68.518 |
| 14800.4 | 68.477 |
| 14810.1 | 68.436 |
| 14819.7 | 68.4 |
| 14829.4 | 68.368 |
| 14839.0 | 68.337 |
| 14848.7 | 68.306 |
| 14858.4 | 68.275 |
| 14868.0 | 68.241 |
| 14877.7 | 68.207 |
| 14887.4 | 68.173 |
| 14897.0 | 68.139 |
| 14906.7 | 68.086 |
| 14916.3 | 68.02 |
| 14926.0 | 67.954 |
| 14935.7 | 67.888 |
| 14945.3 | 67.816 |
| 14955.0 | 67.718 |
| 14964.6 | 67.619 |
| 14974.3 | 67.521 |
| 14984.0 | 67.423 |
| 14993.6 | 67.338 |
| 15003.3 | 67.259 |
| 15012.9 | 67.18 |
| 15022.6 | 67.101 |
| 15032.3 | 67.025 |
| 15041.9 | 66.961 |
| 15051.6 | 66.897 |
| 15061.2 | 66.833 |
| 15070.9 | 66.77 |
| 15080.6 | 66.698 |
| 15090.2 | 66.622 |
| 15099.9 | 66.546 |
| 15109.6 | 66.47 |
| 15119.2 | 66.393 |
| 15128.9 | 66.305 |
| 15138.5 | 66.217 |
| 15148.2 | 66.129 |
| 15157.9 | 66.041 |
| 15167.5 | 65.954 |
| 15177.2 | 65.867 |
| 15186.8 | 65.78 |
| 15196.5 | 65.693 |
| 15206.2 | 65.606 |
| 15215.8 | 65.524 |
| 15225.5 | 65.442 |
| 15235.1 | 65.361 |
| 15244.8 | 65.28 |
| 15254.5 | 65.2 |
| 15264.1 | 65.121 |
| 15273.8 | 65.043 |
| 15283.4 | 64.964 |
| 15293.1 | 64.886 |
| 15302.8 | 64.807 |
| 15312.4 | 64.728 |
| 15322.1 | 64.65 |
| 15331.8 | 64.571 |
| 15341.4 | 64.493 |
| 15351.1 | 64.412 |
| 15360.7 | 64.33 |
| 15370.4 | 64.249 |
| 15380.1 | 64.167 |
| 15389.7 | 64.083 |
| 15399.4 | 63.992 |
| 15409.0 | 63.901 |
| 15418.7 | 63.81 |
| 15428.4 | 63.719 |
| 15438.0 | 63.62 |
| 15447.7 | 63.515 |
| 15457.3 | 63.409 |
| 15467.0 | 63.304 |
| 15476.7 | 63.199 |
| 15486.3 | 63.087 |
| 15496.0 | 62.973 |
| 15505.6 | 62.858 |
| 15515.3 | 62.744 |
| 15525.0 | 62.631 |
| 15534.6 | 62.516 |
| 15544.3 | 62.401 |
| 15554.0 | 62.286 |
| 15563.6 | 62.172 |
| 15573.3 | 62.058 |
| 15582.9 | 61.949 |
| 15592.6 | 61.839 |
| 15602.3 | 61.73 |
| 15611.9 | 61.621 |
| 15621.6 | 61.515 |
| 15631.2 | 61.414 |
| 15640.9 | 61.314 |
| 15650.6 | 61.214 |
| 15660.2 | 61.115 |
| 15669.9 | 61.019 |
| 15679.5 | 60.928 |
| 15689.2 | 60.838 |
| 15698.9 | 60.748 |
| 15708.5 | 60.658 |
| 15718.2 | 60.571 |
| 15727.8 | 60.487 |
| 15737.5 | 60.403 |
| 15747.2 | 60.319 |
| 15756.8 | 60.236 |
| 15766.5 | 60.153 |
| 15776.2 | 60.071 |
| 15785.8 | 59.989 |
| 15795.5 | 59.907 |
| 15805.1 | 59.826 |
| 15814.8 | 59.74 |
| 15824.5 | 59.651 |
| 15834.1 | 59.562 |
| 15843.8 | 59.473 |
| 15853.4 | 59.384 |
| 15863.1 | 59.283 |
| 15872.8 | 59.173 |
| 15882.4 | 59.064 |
| 15892.1 | 58.954 |
| 15901.7 | 58.844 |
| 15911.4 | 58.72 |
| 15921.1 | 58.583 |
| 15930.7 | 58.446 |
| 15940.4 | 58.31 |
| 15950.0 | 58.173 |
| 15959.7 | 58.029 |
| 15969.4 | 57.875 |
| 15979.0 | 57.722 |
| 15988.7 | 57.569 |
| 15998.4 | 57.416 |
| 16008.0 | 57.266 |
| 16017.7 | 57.118 |
| 16027.3 | 56.971 |
| 16037.0 | 56.824 |
| 16046.7 | 56.678 |
| 16056.3 | 56.537 |
| 16066.0 | 56.414 |
| 16075.6 | 56.29 |
| 16085.3 | 56.168 |
| 16095.0 | 56.045 |
| 16104.6 | 55.924 |
| 16114.3 | 55.833 |
| 16123.9 | 55.741 |
| 16133.6 | 55.649 |
| 16143.3 | 55.558 |
| 16152.9 | 55.466 |
| 16162.6 | 55.405 |
| 16172.2 | 55.347 |
| 16181.9 | 55.29 |
| 16191.6 | 55.233 |
| 16201.2 | 55.176 |
| 16210.9 | 55.143 |
| 16220.5 | 55.123 |
| 16230.2 | 55.103 |
| 16239.9 | 55.082 |
| 16249.5 | 55.062 |
| 16259.2 | 55.055 |
| 16268.9 | 55.069 |
| 16278.5 | 55.083 |
| 16288.2 | 55.097 |
| 16297.8 | 55.112 |
| 16307.5 | 55.128 |
| 16317.2 | 55.169 |
| 16326.8 | 55.209 |
| 16336.5 | 55.249 |
| 16346.1 | 55.289 |
| 16355.8 | 55.329 |
| 16365.5 | 55.381 |
| 16375.1 | 55.435 |
| 16384.8 | 55.489 |
| 16394.4 | 55.543 |
| 16404.1 | 55.597 |
| 16413.8 | 55.652 |
| 16423.4 | 55.708 |
| 16433.1 | 55.764 |
| 16442.7 | 55.82 |
| 16452.4 | 55.876 |
| 16462.1 | 55.932 |
| 16471.7 | 55.982 |
| 16481.4 | 56.032 |
| 16491.1 | 56.082 |
| 16500.7 | 56.132 |
| 16510.4 | 56.182 |
| 16520.0 | 56.224 |
| 16529.7 | 56.262 |
| 16539.4 | 56.3 |
| 16549.0 | 56.337 |
| 16558.7 | 56.375 |
| 16568.3 | 56.41 |
| 16578.0 | 56.427 |
| 16587.7 | 56.444 |
| 16597.3 | 56.461 |
| 16607.0 | 56.478 |
| 16616.6 | 56.495 |
| 16626.3 | 56.493 |
| 16636.0 | 56.48 |
| 16645.6 | 56.468 |
| 16655.3 | 56.455 |
| 16664.9 | 56.443 |
| 16674.6 | 56.427 |
| 16684.3 | 56.383 |
| 16693.9 | 56.34 |
| 16703.6 | 56.297 |
| 16713.3 | 56.254 |
| 16722.9 | 56.211 |
| 16732.6 | 56.156 |
| 16742.2 | 56.09 |
| 16751.9 | 56.025 |
| 16761.6 | 55.96 |
| 16771.2 | 55.895 |
| 16780.9 | 55.83 |
| 16790.5 | 55.753 |
| 16800.2 | 55.675 |
| 16809.9 | 55.597 |
| 16819.5 | 55.519 |
| 16829.2 | 55.441 |
| 16838.8 | 55.361 |
| 16848.5 | 55.275 |
| 16858.2 | 55.188 |
| 16867.8 | 55.102 |
| 16877.5 | 55.015 |
| 16887.1 | 54.929 |
| 16896.8 | 54.841 |
| 16906.5 | 54.75 |
| 16916.1 | 54.66 |
| 16925.8 | 54.57 |
| 16935.5 | 54.48 |
| 16945.1 | 54.39 |
| 16954.8 | 54.298 |
| 16964.4 | 54.206 |
| 16974.1 | 54.114 |
| 16983.8 | 54.023 |
| 16993.4 | 53.931 |
| 17003.1 | 53.838 |
| 17012.7 | 53.738 |
| 17022.4 | 53.638 |
| 17032.1 | 53.538 |
| 17041.7 | 53.438 |
| 17051.4 | 53.338 |
| 17061.0 | 53.233 |
| 17070.7 | 53.12 |
| 17080.4 | 53.007 |
| 17090.0 | 52.893 |
| 17099.7 | 52.78 |
| 17109.3 | 52.667 |
| 17119.0 | 52.549 |
| 17128.7 | 52.427 |
| 17138.3 | 52.305 |
| 17148.0 | 52.183 |
| 17157.7 | 52.061 |
| 17167.3 | 51.939 |
| 17177.0 | 51.817 |
| 17186.6 | 51.696 |
| 17196.3 | 51.575 |
| 17206.0 | 51.454 |
| 17215.6 | 51.333 |
| 17225.3 | 51.212 |
| 17234.9 | 51.102 |
| 17244.6 | 50.994 |
| 17254.3 | 50.887 |
| 17263.9 | 50.779 |
| 17273.6 | 50.672 |
| 17283.2 | 50.565 |
| 17292.9 | 50.477 |
| 17302.6 | 50.393 |
| 17312.2 | 50.309 |
| 17321.9 | 50.225 |
| 17331.5 | 50.141 |
| 17341.2 | 50.058 |
| 17350.9 | 49.996 |
| 17360.5 | 49.938 |
| 17370.2 | 49.88 |
| 17379.9 | 49.822 |
| 17389.5 | 49.764 |
| 17399.2 | 49.707 |
| 17408.8 | 49.67 |
| 17418.5 | 49.638 |
| 17428.2 | 49.606 |
| 17437.8 | 49.574 |
| 17447.5 | 49.543 |
| 17457.1 | 49.511 |
| 17466.8 | 49.495 |
| 17476.5 | 49.484 |
| 17486.1 | 49.473 |
| 17495.8 | 49.462 |
| 17505.4 | 49.451 |
| 17515.1 | 49.44 |
| 17524.8 | 49.434 |
| 17534.4 | 49.432 |
| 17544.1 | 49.429 |
| 17553.7 | 49.427 |
| 17563.4 | 49.425 |
| 17573.1 | 49.422 |
| 17582.7 | 49.42 |
| 17592.4 | 49.419 |
| 17602.0 | 49.418 |
| 17611.7 | 49.416 |
| 17621.4 | 49.415 |
| 17631.0 | 49.413 |
| 17640.7 | 49.412 |
| 17650.4 | 49.413 |
| 17660.0 | 49.413 |
| 17669.7 | 49.413 |
| 17679.3 | 49.414 |
| 17689.0 | 49.414 |
| 17698.7 | 49.414 |
| 17708.3 | 49.415 |
| 17718.0 | 49.416 |
| 17727.6 | 49.417 |
| 17737.3 | 49.418 |
| 17747.0 | 49.419 |
| 17756.6 | 49.42 |
| 17766.3 | 49.418 |
| 17775.9 | 49.416 |
| 17785.6 | 49.413 |
| 17795.3 | 49.41 |
| 17804.9 | 49.408 |
| 17814.6 | 49.405 |
| 17824.2 | 49.4 |
| 17833.9 | 49.393 |
| 17843.6 | 49.385 |
| 17853.2 | 49.378 |
| 17862.9 | 49.371 |
| 17872.6 | 49.363 |
| 17882.2 | 49.355 |
| 17891.9 | 49.345 |
| 17901.5 | 49.334 |
| 17911.2 | 49.324 |
| 17920.9 | 49.313 |
| 17930.5 | 49.303 |
| 17940.2 | 49.292 |
| 17949.8 | 49.277 |
| 17959.5 | 49.26 |
| 17969.2 | 49.242 |
| 17978.8 | 49.225 |
| 17988.5 | 49.208 |
| 17998.1 | 49.191 |
| 18007.8 | 49.17 |
| 18017.5 | 49.139 |
| 18027.1 | 49.107 |
| 18036.8 | 49.076 |
| 18046.4 | 49.045 |
| 18056.1 | 49.014 |
| 18065.8 | 48.983 |
| 18075.4 | 48.94 |
| 18085.1 | 48.894 |
| 18094.8 | 48.848 |
| 18104.4 | 48.802 |
| 18114.1 | 48.756 |
| 18123.7 | 48.71 |
| 18133.4 | 48.661 |
| 18143.1 | 48.604 |
| 18152.7 | 48.548 |
| 18162.4 | 48.491 |
| 18172.0 | 48.435 |
| 18181.7 | 48.379 |
| 18191.4 | 48.322 |
| 18201.0 | 48.262 |
| 18210.7 | 48.2 |
| 18220.3 | 48.138 |
| 18230.0 | 48.075 |
| 18239.7 | 48.013 |
| 18249.3 | 47.951 |
| 18259.0 | 47.889 |
| 18268.6 | 47.823 |
| 18278.3 | 47.757 |
| 18288.0 | 47.691 |
| 18297.6 | 47.625 |
| 18307.3 | 47.56 |
| 18317.0 | 47.494 |
| 18326.6 | 47.426 |
| 18336.3 | 47.354 |
| 18345.9 | 47.282 |
| 18355.6 | 47.21 |
| 18365.3 | 47.138 |
| 18374.9 | 47.066 |
| 18384.6 | 46.994 |
| 18394.2 | 46.917 |
| 18403.9 | 46.836 |
| 18413.6 | 46.755 |
| 18423.2 | 46.675 |
| 18432.9 | 46.594 |
| 18442.5 | 46.514 |
| 18452.2 | 46.434 |
| 18461.9 | 46.347 |
| 18471.5 | 46.26 |
| 18481.2 | 46.173 |
| 18490.8 | 46.086 |
| 18500.5 | 45.998 |
| 18510.2 | 45.912 |
| 18519.8 | 45.824 |
| 18529.5 | 45.732 |
| 18539.2 | 45.639 |
| 18548.8 | 45.547 |
| 18558.5 | 45.455 |
| 18568.1 | 45.363 |
| 18577.8 | 45.27 |
| 18587.5 | 45.177 |
| 18597.1 | 45.076 |
| 18606.8 | 44.974 |
| 18616.4 | 44.873 |
| 18626.1 | 44.773 |
| 18635.8 | 44.672 |
| 18645.4 | 44.571 |
| 18655.1 | 44.466 |
| 18664.7 | 44.348 |
| 18674.4 | 44.231 |
| 18684.1 | 44.113 |
| 18693.7 | 43.996 |
| 18703.4 | 43.879 |
| 18713.0 | 43.761 |
| 18722.7 | 43.639 |
| 18732.4 | 43.5 |
| 18742.0 | 43.362 |
| 18751.7 | 43.224 |
| 18761.4 | 43.087 |
| 18771.0 | 42.949 |
| 18780.7 | 42.812 |
| 18790.3 | 42.67 |
| 18800.0 | 42.517 |
| 18809.7 | 42.363 |
| 18819.3 | 42.21 |
| 18829.0 | 42.057 |
| 18838.6 | 41.904 |
| 18848.3 | 41.752 |
| 18858.0 | 41.597 |
| 18867.6 | 41.436 |
| 18877.3 | 41.274 |
| 18886.9 | 41.112 |
| 18896.6 | 40.951 |
| 18906.3 | 40.789 |
| 18915.9 | 40.628 |
| 18925.6 | 40.467 |
| 18935.2 | 40.296 |
| 18944.9 | 40.125 |
| 18954.6 | 39.955 |
| 18964.2 | 39.785 |
| 18973.9 | 39.614 |
| 18983.5 | 39.444 |
| 18993.2 | 39.275 |
| 19002.9 | 39.099 |
| 19012.5 | 38.922 |
| 19022.2 | 38.746 |
| 19031.9 | 38.569 |
| 19041.5 | 38.393 |
| 19051.2 | 38.217 |
| 19060.8 | 38.042 |
| 19070.5 | 37.866 |
| 19080.2 | 37.689 |
| 19089.8 | 37.514 |
| 19099.5 | 37.338 |
| 19109.1 | 37.163 |
| 19118.8 | 36.987 |
| 19128.5 | 36.812 |
| 19138.1 | 36.636 |
| 19147.8 | 36.459 |
| 19157.4 | 36.282 |
| 19167.1 | 36.105 |
| 19176.8 | 35.929 |
| 19186.4 | 35.752 |
| 19196.1 | 35.576 |
| 19205.7 | 35.399 |
| 19215.4 | 35.211 |
| 19225.1 | 35.024 |
| 19234.7 | 34.837 |
| 19244.4 | 34.649 |
| 19254.1 | 34.462 |
| 19263.7 | 34.275 |
| 19273.4 | 34.089 |
| 19283.0 | 33.893 |
| 19292.7 | 33.691 |
| 19302.4 | 33.49 |
| 19312.0 | 33.289 |
| 19321.7 | 33.088 |
| 19331.3 | 32.888 |
| 19341.0 | 32.687 |
| 19350.7 | 32.484 |
| 19360.3 | 32.271 |
| 19370.0 | 32.059 |
| 19379.6 | 31.846 |
| 19389.3 | 31.634 |
| 19399.0 | 31.422 |
| 19408.6 | 31.21 |
| 19418.3 | 30.998 |
| 19427.9 | 30.779 |
| 19437.6 | 30.556 |
| 19447.3 | 30.334 |
| 19456.9 | 30.112 |
| 19466.6 | 29.891 |
| 19476.3 | 29.669 |
| 19485.9 | 29.448 |
| 19495.6 | 29.225 |
| 19505.2 | 28.992 |
| 19514.9 | 28.759 |
| 19524.6 | 28.526 |
| 19534.2 | 28.293 |
| 19543.9 | 28.061 |
| 19553.5 | 27.829 |
| 19563.2 | 27.597 |
| 19572.9 | 27.357 |
| 19582.5 | 27.108 |
| 19592.2 | 26.86 |
| 19601.8 | 26.612 |
| 19611.5 | 26.365 |
| 19621.2 | 26.118 |
| 19630.8 | 25.871 |
| 19640.5 | 25.624 |
| 19650.1 | 25.362 |
| 19659.8 | 25.098 |
| 19669.5 | 24.834 |
| 19679.1 | 24.57 |
| 19688.8 | 24.307 |
| 19698.5 | 24.044 |
| 19708.1 | 23.781 |
| 19717.8 | 23.518 |
| 19727.4 | 23.251 |
| 19737.1 | 22.984 |
| 19746.8 | 22.717 |
| 19756.4 | 22.451 |
| 19766.1 | 22.185 |
| 19775.7 | 21.919 |
| 19785.4 | 21.654 |
| 19795.1 | 21.389 |
| 19804.7 | 21.128 |
| 19814.4 | 20.868 |
| 19824.0 | 20.607 |
| 19833.7 | 20.347 |
| 19843.4 | 20.087 |
| 19853.0 | 19.827 |
| 19862.7 | 19.567 |
| 19872.3 | 19.314 |
| 19882.0 | 19.066 |
| 19891.7 | 18.818 |
| 19901.3 | 18.571 |
| 19911.0 | 18.324 |
| 19920.7 | 18.078 |
| 19930.3 | 17.831 |
| 19940.0 | 17.585 |
| 19949.6 | 17.354 |
| 19959.3 | 17.134 |
| 19969.0 | 16.914 |
| 19978.6 | 16.694 |
| 19988.3 | 16.475 |
| 19997.9 | 16.256 |
| 20007.6 | 16.037 |
| 20017.3 | 15.818 |
| 20026.9 | 15.618 |
| 20036.6 | 15.429 |
| 20046.2 | 15.24 |
| 20055.9 | 15.051 |
| 20065.6 | 14.863 |
| 20075.2 | 14.675 |
| 20084.9 | 14.487 |
| 20094.5 | 14.299 |
| 20104.2 | 14.123 |
| 20113.9 | 13.956 |
| 20123.5 | 13.79 |
| 20133.2 | 13.623 |
| 20142.9 | 13.457 |
| 20152.5 | 13.291 |
| 20162.2 | 13.125 |
| 20171.8 | 12.959 |
| 20181.5 | 12.8 |
| 20191.2 | 12.65 |
| 20200.8 | 12.499 |
| 20210.5 | 12.349 |
| 20220.1 | 12.198 |
| 20229.8 | 12.048 |
| 20239.5 | 11.898 |
| 20249.1 | 11.748 |
| 20258.8 | 11.602 |
| 20268.4 | 11.464 |
| 20278.1 | 11.326 |
| 20287.8 | 11.188 |
| 20297.4 | 11.05 |
| 20307.1 | 10.912 |
| 20316.7 | 10.774 |
| 20326.4 | 10.636 |
| 20336.1 | 10.5 |
| 20345.7 | 10.375 |
| 20355.4 | 10.25 |
| 20365.0 | 10.126 |
| 20374.7 | 10.001 |
| 20384.4 | 9.876 |
| 20394.0 | 9.752 |
| 20403.7 | 9.628 |
| 20413.4 | 9.504 |
| 20423.0 | 9.392 |
| 20432.7 | 9.283 |
| 20442.3 | 9.174 |
| 20452.0 | 9.066 |
| 20461.7 | 8.957 |
| 20471.3 | 8.849 |
| 20481.0 | 8.741 |
| 20490.6 | 8.632 |
| 20500.3 | 8.531 |
| 20510.0 | 8.438 |
| 20519.6 | 8.346 |
| 20529.3 | 8.253 |
| 20538.9 | 8.161 |
| 20548.6 | 8.068 |
| 20558.3 | 7.976 |
| 20567.9 | 7.884 |
| 20577.6 | 7.792 |
| 20587.2 | 7.712 |
| 20596.9 | 7.633 |
| 20606.6 | 7.553 |
| 20616.2 | 7.474 |
| 20625.9 | 7.395 |
| 20635.6 | 7.315 |
| 20645.2 | 7.236 |
| 20654.9 | 7.157 |
| 20664.5 | 7.084 |
| 20674.2 | 7.015 |
| 20683.9 | 6.945 |
| 20693.5 | 6.877 |
| 20703.2 | 6.808 |
| 20712.8 | 6.739 |
| 20722.5 | 6.67 |
| 20732.2 | 6.601 |
| 20741.8 | 6.533 |
| 20751.5 | 6.473 |
| 20761.1 | 6.413 |
| 20770.8 | 6.353 |
| 20780.5 | 6.293 |
| 20790.1 | 6.233 |
| 20799.8 | 6.173 |
| 20809.4 | 6.114 |
| 20819.1 | 6.054 |
| 20828.8 | 5.997 |
| 20838.4 | 5.945 |
| 20848.1 | 5.892 |
| 20857.8 | 5.839 |
| 20867.4 | 5.787 |
| 20877.1 | 5.734 |
| 20886.7 | 5.682 |
| 20896.4 | 5.63 |
| 20906.1 | 5.577 |
| 20915.7 | 5.528 |
| 20925.4 | 5.479 |
| 20935.0 | 5.431 |
| 20944.7 | 5.382 |
| 20954.4 | 5.334 |
| 20964.0 | 5.286 |
| 20973.7 | 5.238 |
| 20983.3 | 5.189 |
| 20993.0 | 5.141 |
| 21002.7 | 5.095 |
| 21012.3 | 5.048 |
| 21022.0 | 5.001 |
| 21031.6 | 4.955 |
| 21041.3 | 4.909 |
| 21051.0 | 4.862 |
| 21060.6 | 4.816 |
| 21070.3 | 4.769 |
| 21080.0 | 4.723 |
| 21089.6 | 4.674 |
| 21099.3 | 4.626 |
| 21108.9 | 4.577 |
| 21118.6 | 4.529 |
| 21128.3 | 4.481 |
| 21137.9 | 4.432 |
| 21147.6 | 4.384 |
| 21157.2 | 4.336 |
| 21166.9 | 4.287 |
| 21176.6 | 4.236 |
| 21186.2 | 4.184 |
| 21195.9 | 4.133 |
| 21205.5 | 4.082 |
| 21215.2 | 4.03 |
| 21224.9 | 3.979 |
| 21234.5 | 3.928 |
| 21244.2 | 3.877 |
| 21253.8 | 3.825 |
| 21263.5 | 3.772 |
| 21273.2 | 3.719 |
| 21282.8 | 3.666 |
| 21292.5 | 3.613 |
| 21302.2 | 3.561 |
| 21311.8 | 3.508 |
| 21321.5 | 3.455 |
| 21331.1 | 3.402 |
| 21340.8 | 3.349 |
| 21350.5 | 3.292 |
| 21360.1 | 3.234 |
| 21369.8 | 3.177 |
| 21379.4 | 3.12 |
| 21389.1 | 3.063 |
| 21398.8 | 3.006 |
| 21408.4 | 2.949 |
| 21418.1 | 2.892 |
| 21427.7 | 2.835 |
| 21437.4 | 2.772 |
| 21447.1 | 2.709 |
| 21456.7 | 2.646 |
| 21466.4 | 2.583 |
| 21476.0 | 2.52 |
| 21485.7 | 2.457 |
| 21495.4 | 2.394 |
| 21505.0 | 2.331 |
| 21514.7 | 2.268 |
| 21524.4 | 2.204 |
| 21534.0 | 2.141 |
| 21543.7 | 2.078 |
| 21553.3 | 2.014 |
| 21563.0 | 1.951 |
| 21572.7 | 1.888 |
| 21582.3 | 1.824 |
| 21592.0 | 1.761 |
| 21601.6 | 1.698 |
| 21611.3 | 1.64 |
| 21621.0 | 1.586 |
| 21630.6 | 1.533 |
| 21640.3 | 1.479 |
| 21649.9 | 1.426 |
| 21659.6 | 1.372 |
| 21669.3 | 1.319 |
| 21678.9 | 1.266 |
| 21688.6 | 1.212 |
| 21698.2 | 1.161 |
| 21707.9 | 1.121 |
| 21717.6 | 1.081 |
| 21727.2 | 1.041 |
| 21736.9 | 1 |
| 21746.5 | 0.96 |
| 21756.2 | 0.92 |
| 21765.9 | 0.88 |
| 21775.5 | 0.84 |
| 21785.2 | 0.8 |
| 21794.9 | 0.767 |
| 21804.5 | 0.737 |
| 21814.2 | 0.706 |
| 21823.8 | 0.676 |
| 21833.5 | 0.646 |
| 21843.2 | 0.616 |
| 21852.8 | 0.585 |
| 21862.5 | 0.555 |
| 21872.1 | 0.525 |
| 21881.8 | 0.496 |
| 21891.5 | 0.474 |
| 21901.1 | 0.451 |
| 21910.8 | 0.428 |
| 21920.4 | 0.405 |
| 21930.1 | 0.382 |
| 21939.8 | 0.36 |
| 21949.4 | 0.337 |
| 21959.1 | 0.314 |
| 21968.7 | 0.292 |
| 21978.4 | 0.273 |
| 21988.1 | 0.258 |
| 21997.7 | 0.242 |
| 22007.4 | 0.227 |
| 22017.1 | 0.212 |
| 22026.7 | 0.196 |
| 22036.4 | 0.181 |
| 22046.0 | 0.165 |
| 22055.7 | 0.15 |
| 22065.4 | 0.135 |
| 22075.0 | 0.126 |
| 22084.7 | 0.117 |
| 22094.3 | 0.109 |
| 22104.0 | 0.1 |
| 22113.7 | 0.092 |
| 22123.3 | 0.083 |
| 22133.0 | 0.075 |
| 22142.6 | 0.067 |
| 22152.3 | 0.058 |
| 22162.0 | 0.051 |
| 22171.6 | 0.049 |
| 22181.3 | 0.047 |
| 22190.9 | 0.045 |
| 22200.6 | 0.043 |
| 22210.3 | 0.041 |
| 22219.9 | 0.04 |
| 22229.6 | 0.038 |
| 22239.3 | 0.036 |
| 22248.9 | 0.034 |
| 22258.6 | 0.034 |
| 22268.2 | 0.038 |
| 22277.9 | 0.042 |
| 22287.6 | 0.045 |
| 22297.2 | 0.049 |
| 22306.9 | 0.053 |
| 22316.5 | 0.057 |
| 22326.2 | 0.061 |
| 22335.9 | 0.064 |
| 22345.5 | 0.068 |
| 22355.2 | 0.073 |
| 22364.8 | 0.078 |
| 22374.5 | 0.083 |
| 22384.2 | 0.088 |
| 22393.8 | 0.093 |
| 22403.5 | 0.098 |
| 22413.1 | 0.104 |
| 22422.8 | 0.109 |
| 22432.5 | 0.114 |
| 22442.1 | 0.119 |
| 22451.8 | 0.123 |
| 22461.5 | 0.124 |
| 22471.1 | 0.125 |
| 22480.8 | 0.126 |
| 22490.4 | 0.127 |
| 22500.1 | 0.128 |
| 22509.8 | 0.129 |
| 22519.4 | 0.13 |
| 22529.1 | 0.131 |
| 22538.7 | 0.132 |
| 22548.4 | 0.132 |
| 22558.1 | 0.129 |
| 22567.7 | 0.126 |
| 22577.4 | 0.123 |
| 22587.0 | 0.121 |
| 22596.7 | 0.118 |
| 22606.4 | 0.115 |
| 22616.0 | 0.112 |
| 22625.7 | 0.109 |
| 22635.3 | 0.107 |
| 22645.0 | 0.104 |
| 22654.7 | 0.1 |
| 22664.3 | 0.097 |
| 22674.0 | 0.094 |
| 22683.7 | 0.09 |
| 22693.3 | 0.087 |
| 22703.0 | 0.084 |
| 22712.6 | 0.08 |
| 22722.3 | 0.077 |
| 22732.0 | 0.074 |
| 22741.6 | 0.07 |
| 22751.3 | 0.068 |
| 22760.9 | 0.065 |
| 22770.6 | 0.063 |
| 22780.3 | 0.06 |
| 22789.9 | 0.058 |
| 22799.6 | 0.056 |
| 22809.2 | 0.053 |
| 22818.9 | 0.051 |
| 22828.6 | 0.048 |
| 22838.2 | 0.046 |
| 22847.9 | 0.044 |
| 22857.5 | 0.043 |
| 22867.2 | 0.042 |
| 22876.9 | 0.042 |
| 22886.5 | 0.041 |
| 22896.2 | 0.04 |
| 22905.9 | 0.039 |
| 22915.5 | 0.038 |
| 22925.2 | 0.037 |
| 22934.8 | 0.036 |
| 22944.5 | 0.035 |
| 22954.2 | 0.037 |
| 22963.8 | 0.039 |
| 22973.5 | 0.04 |
| 22983.1 | 0.042 |
| 22992.8 | 0.043 |
| 23002.5 | 0.045 |
| 23012.1 | 0.047 |
| 23021.8 | 0.048 |
| 23031.4 | 0.05 |
| 23041.1 | 0.052 |
| 23050.8 | 0.054 |
| 23060.4 | 0.058 |
| 23070.1 | 0.062 |
| 23079.7 | 0.065 |
| 23089.4 | 0.069 |
| 23099.1 | 0.073 |
| 23108.7 | 0.076 |
| 23118.4 | 0.08 |
| 23128.0 | 0.084 |
| 23137.7 | 0.087 |
| 23147.4 | 0.091 |
| 23157.0 | 0.095 |
| 23166.7 | 0.099 |
| 23176.4 | 0.102 |
| 23186.0 | 0.106 |
| 23195.7 | 0.11 |
| 23205.3 | 0.113 |
| 23215.0 | 0.117 |
| 23224.7 | 0.121 |
| 23234.3 | 0.124 |
| 23244.0 | 0.128 |
| 23253.6 | 0.132 |
| 23263.3 | 0.132 |
| 23273.0 | 0.133 |
| 23282.6 | 0.133 |
| 23292.3 | 0.134 |
| 23301.9 | 0.134 |
| 23311.6 | 0.135 |
| 23321.3 | 0.135 |
| 23330.9 | 0.136 |
| 23340.6 | 0.136 |
| 23350.2 | 0.137 |
| 23359.9 | 0.136 |
| 23369.6 | 0.133 |
| 23379.2 | 0.129 |
| 23388.9 | 0.125 |
| 23398.6 | 0.122 |
| 23408.2 | 0.118 |
| 23417.9 | 0.114 |
| 23427.5 | 0.111 |
| 23437.2 | 0.107 |
| 23446.9 | 0.103 |
| 23456.5 | 0.1 |
| 23466.2 | 0.096 |
| 23475.8 | 0.094 |
| 23485.5 | 0.092 |
| 23495.2 | 0.09 |
| 23504.8 | 0.088 |
| 23514.5 | 0.086 |
| 23524.1 | 0.084 |
| 23533.8 | 0.082 |
| 23543.5 | 0.079 |
| 23553.1 | 0.077 |
| 23562.8 | 0.075 |
| 23572.4 | 0.075 |
| 23582.1 | 0.08 |
| 23591.8 | 0.086 |
| 23601.4 | 0.092 |
| 23611.1 | 0.097 |
| 23620.8 | 0.103 |
| 23630.4 | 0.109 |
| 23640.1 | 0.114 |
| 23649.7 | 0.12 |
| 23659.4 | 0.125 |
| 23669.1 | 0.131 |
| 23678.7 | 0.137 |
| 23688.4 | 0.144 |
| 23698.0 | 0.152 |
| 23707.7 | 0.16 |
| 23717.4 | 0.167 |
| 23727.0 | 0.175 |
| 23736.7 | 0.183 |
| 23746.3 | 0.19 |
| 23756.0 | 0.198 |
| 23765.7 | 0.206 |
| 23775.3 | 0.213 |
| 23785.0 | 0.221 |
| 23794.6 | 0.218 |
| 23804.3 | 0.213 |
| 23814.0 | 0.208 |
| 23823.6 | 0.203 |
| 23833.3 | 0.198 |
| 23843.0 | 0.193 |
| 23852.6 | 0.188 |
| 23862.3 | 0.183 |
| 23871.9 | 0.178 |
| 23881.6 | 0.174 |
| 23891.3 | 0.169 |
| 23900.9 | 0.16 |
| 23910.6 | 0.147 |
| 23920.2 | 0.134 |
| 23929.9 | 0.122 |
| 23939.6 | 0.109 |
| 23949.2 | 0.096 |
| 23958.9 | 0.083 |
| 23968.5 | 0.071 |
| 23978.2 | 0.058 |
| 23987.9 | 0.045 |
| 23997.5 | 0.033 |
| 24007.2 | 0.021 |
| 24016.8 | 0.019 |
| 24026.5 | 0.017 |
| 24036.2 | 0.015 |
| 24045.8 | 0.013 |
| 24055.5 | 0.012 |
| 24065.2 | 0.01 |
| 24074.8 | 0.008 |
| 24084.5 | 0.006 |
| 24094.1 | 0.004 |
| 24103.8 | 0.003 |
| 24113.5 | 0.001 |
| 24123.1 | 0 |
| 24132.8 | 0.001 |
| 24142.4 | 0.001 |
| 24152.1 | 0.002 |
| 24161.8 | 0.002 |
| 24171.4 | 0.003 |
| 24181.1 | 0.003 |
| 24190.7 | 0.004 |
| 24200.4 | 0.004 |
| 24210.1 | 0.005 |
| 24219.7 | 0.005 |
| 24229.4 | 0.006 |
| 24239.0 | 0.006 |
| 24248.7 | 0.006 |
| 24258.4 | 0.006 |
| 24268.0 | 0.006 |
| 24277.7 | 0.007 |
| 24287.4 | 0.007 |
| 24297.0 | 0.007 |
| 24306.7 | 0.007 |
| 24316.3 | 0.008 |
| 24326.0 | 0.008 |
| 24335.7 | 0.008 |
| 24345.3 | 0.008 |
| 24355.0 | 0.007 |
| 24364.6 | 0.007 |
| 24374.3 | 0.006 |
| 24384.0 | 0.005 |
| 24393.6 | 0.005 |
| 24403.3 | 0.004 |
| 24412.9 | 0.003 |
| 24422.6 | 0.003 |
| 24432.3 | 0.002 |
| 24441.9 | 0.001 |
| 24451.6 | 0.001 |
| 24461.2 | 0 |
| 24470.9 | 0 |
| 24480.6 | 0 |
| 24490.2 | 0 |
| 24499.9 | 0 |
| 24509.5 | 0 |
| 24519.2 | 0 |
| 24528.9 | 0 |
| 24538.5 | 0 |
| 24548.2 | 0 |
| 24557.9 | 0 |
| 24567.5 | 0 |
| 24577.2 | 0 |
| 24586.8 | 0 |
| 24596.5 | 0 |
| 24606.2 | 0 |
| 24615.8 | 0 |
| 24625.5 | 0 |
| 24635.1 | 0 |
| 24644.8 | 0 |
| 24654.5 | 0 |
| 24664.1 | 0 |
| 24673.8 | 0 |
| 24683.4 | 0 |
| 24693.1 | 0 |
| 24702.8 | 0 |
| 24712.4 | 0 |
| 24722.1 | 0 |
| 24731.7 | 0 |
| 24741.4 | 0 |
| 24751.1 | 0 |
| 24760.7 | 0 |
| 24770.4 | 0 |
| 24780.1 | 0 |
| 24789.7 | 0 |
| 24799.4 | 0 |
| 24809.0 | 0 |
| 24818.7 | 0 |
| 24828.4 | 0 |
| 24838.0 | 0 |
| 24847.7 | 0 |
| 24857.3 | 0 |
| 24867.0 | 0 |
| 24876.7 | 0 |
| 24886.3 | 0 |
| 24896.0 | 0 |
| 24905.6 | 0 |
| 24915.3 | 0 |
| 24925.0 | 0 |
| 24934.6 | 0.003 |
| 24944.3 | 0.008 |
| 24953.9 | 0.014 |
| 24963.6 | 0.02 |
| 24973.3 | 0.026 |
| 24982.9 | 0.031 |
| 24992.6 | 0.037 |
| 25002.3 | 0.043 |